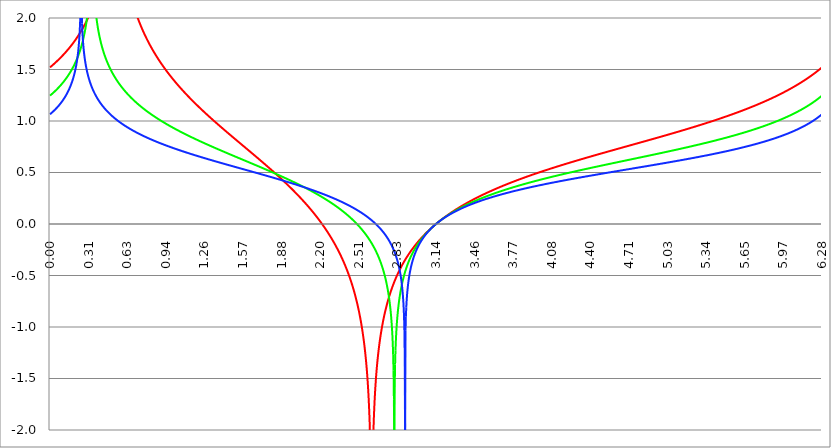
| Category | Series 1 | Series 0 | Series 2 |
|---|---|---|---|
| 0.0 | 1.521 | 1.246 | 1.066 |
| 0.00314159265358979 | 1.524 | 1.25 | 1.069 |
| 0.00628318530717958 | 1.527 | 1.253 | 1.072 |
| 0.00942477796076938 | 1.53 | 1.256 | 1.075 |
| 0.0125663706143592 | 1.533 | 1.259 | 1.078 |
| 0.015707963267949 | 1.537 | 1.263 | 1.082 |
| 0.0188495559215388 | 1.54 | 1.266 | 1.085 |
| 0.0219911485751285 | 1.543 | 1.269 | 1.089 |
| 0.0251327412287183 | 1.546 | 1.273 | 1.092 |
| 0.0282743338823081 | 1.55 | 1.276 | 1.096 |
| 0.0314159265358979 | 1.553 | 1.279 | 1.099 |
| 0.0345575191894877 | 1.557 | 1.283 | 1.103 |
| 0.0376991118430775 | 1.56 | 1.286 | 1.106 |
| 0.0408407044966673 | 1.563 | 1.29 | 1.11 |
| 0.0439822971502571 | 1.567 | 1.294 | 1.114 |
| 0.0471238898038469 | 1.57 | 1.297 | 1.118 |
| 0.0502654824574367 | 1.574 | 1.301 | 1.122 |
| 0.0534070751110265 | 1.577 | 1.305 | 1.126 |
| 0.0565486677646163 | 1.581 | 1.308 | 1.13 |
| 0.059690260418206 | 1.584 | 1.312 | 1.134 |
| 0.0628318530717958 | 1.588 | 1.316 | 1.138 |
| 0.0659734457253856 | 1.591 | 1.32 | 1.142 |
| 0.0691150383789754 | 1.595 | 1.324 | 1.146 |
| 0.0722566310325652 | 1.599 | 1.328 | 1.151 |
| 0.075398223686155 | 1.602 | 1.332 | 1.155 |
| 0.0785398163397448 | 1.606 | 1.336 | 1.16 |
| 0.0816814089933346 | 1.61 | 1.34 | 1.164 |
| 0.0848230016469244 | 1.614 | 1.344 | 1.169 |
| 0.0879645943005142 | 1.617 | 1.349 | 1.174 |
| 0.091106186954104 | 1.621 | 1.353 | 1.179 |
| 0.0942477796076937 | 1.625 | 1.357 | 1.184 |
| 0.0973893722612835 | 1.629 | 1.362 | 1.189 |
| 0.100530964914873 | 1.633 | 1.366 | 1.194 |
| 0.103672557568463 | 1.637 | 1.371 | 1.199 |
| 0.106814150222053 | 1.641 | 1.375 | 1.205 |
| 0.109955742875643 | 1.645 | 1.38 | 1.21 |
| 0.113097335529233 | 1.649 | 1.385 | 1.216 |
| 0.116238928182822 | 1.653 | 1.389 | 1.222 |
| 0.119380520836412 | 1.657 | 1.394 | 1.228 |
| 0.122522113490002 | 1.661 | 1.399 | 1.234 |
| 0.125663706143592 | 1.665 | 1.404 | 1.24 |
| 0.128805298797181 | 1.67 | 1.409 | 1.246 |
| 0.131946891450771 | 1.674 | 1.414 | 1.253 |
| 0.135088484104361 | 1.678 | 1.42 | 1.26 |
| 0.138230076757951 | 1.682 | 1.425 | 1.267 |
| 0.141371669411541 | 1.687 | 1.43 | 1.274 |
| 0.14451326206513 | 1.691 | 1.436 | 1.281 |
| 0.14765485471872 | 1.696 | 1.441 | 1.289 |
| 0.15079644737231 | 1.7 | 1.447 | 1.296 |
| 0.1539380400259 | 1.705 | 1.453 | 1.304 |
| 0.15707963267949 | 1.709 | 1.459 | 1.313 |
| 0.160221225333079 | 1.714 | 1.465 | 1.321 |
| 0.163362817986669 | 1.718 | 1.471 | 1.33 |
| 0.166504410640259 | 1.723 | 1.477 | 1.339 |
| 0.169646003293849 | 1.728 | 1.483 | 1.349 |
| 0.172787595947439 | 1.733 | 1.49 | 1.358 |
| 0.175929188601028 | 1.737 | 1.496 | 1.369 |
| 0.179070781254618 | 1.742 | 1.503 | 1.379 |
| 0.182212373908208 | 1.747 | 1.51 | 1.391 |
| 0.185353966561798 | 1.752 | 1.517 | 1.402 |
| 0.188495559215388 | 1.757 | 1.524 | 1.414 |
| 0.191637151868977 | 1.762 | 1.531 | 1.427 |
| 0.194778744522567 | 1.767 | 1.538 | 1.441 |
| 0.197920337176157 | 1.772 | 1.546 | 1.455 |
| 0.201061929829747 | 1.778 | 1.554 | 1.47 |
| 0.204203522483336 | 1.783 | 1.562 | 1.486 |
| 0.207345115136926 | 1.788 | 1.57 | 1.504 |
| 0.210486707790516 | 1.794 | 1.578 | 1.522 |
| 0.213628300444106 | 1.799 | 1.587 | 1.542 |
| 0.216769893097696 | 1.804 | 1.595 | 1.564 |
| 0.219911485751285 | 1.81 | 1.604 | 1.587 |
| 0.223053078404875 | 1.816 | 1.614 | 1.613 |
| 0.226194671058465 | 1.821 | 1.623 | 1.642 |
| 0.229336263712055 | 1.827 | 1.633 | 1.674 |
| 0.232477856365645 | 1.833 | 1.643 | 1.712 |
| 0.235619449019234 | 1.839 | 1.653 | 1.755 |
| 0.238761041672824 | 1.845 | 1.664 | 1.808 |
| 0.241902634326414 | 1.851 | 1.675 | 1.873 |
| 0.245044226980004 | 1.857 | 1.686 | 1.962 |
| 0.248185819633594 | 1.863 | 1.698 | 2.099 |
| 0.251327412287183 | 1.869 | 1.71 | 2.409 |
| 0.254469004940773 | 1.875 | 1.723 | 2.337 |
| 0.257610597594363 | 1.882 | 1.736 | 2.075 |
| 0.260752190247953 | 1.888 | 1.749 | 1.947 |
| 0.263893782901543 | 1.895 | 1.763 | 1.863 |
| 0.267035375555132 | 1.901 | 1.778 | 1.799 |
| 0.270176968208722 | 1.908 | 1.794 | 1.747 |
| 0.273318560862312 | 1.915 | 1.81 | 1.705 |
| 0.276460153515902 | 1.922 | 1.827 | 1.668 |
| 0.279601746169492 | 1.929 | 1.844 | 1.636 |
| 0.282743338823082 | 1.936 | 1.863 | 1.607 |
| 0.285884931476671 | 1.943 | 1.883 | 1.581 |
| 0.289026524130261 | 1.95 | 1.904 | 1.558 |
| 0.292168116783851 | 1.957 | 1.926 | 1.536 |
| 0.295309709437441 | 1.965 | 1.95 | 1.517 |
| 0.298451302091031 | 1.972 | 1.976 | 1.498 |
| 0.30159289474462 | 1.98 | 2.004 | 1.481 |
| 0.30473448739821 | 1.988 | 2.034 | 1.465 |
| 0.3078760800518 | 1.996 | 2.067 | 1.449 |
| 0.31101767270539 | 2.004 | 2.103 | 1.435 |
| 0.31415926535898 | 2.012 | 2.144 | 1.421 |
| 0.31730085801257 | 2.02 | 2.19 | 1.408 |
| 0.320442450666159 | 2.029 | 2.243 | 1.396 |
| 0.323584043319749 | 2.037 | 2.305 | 1.384 |
| 0.326725635973339 | 2.046 | 2.381 | 1.373 |
| 0.329867228626929 | 2.055 | 2.477 | 1.362 |
| 0.333008821280519 | 2.064 | 2.611 | 1.352 |
| 0.336150413934108 | 2.073 | 2.829 | 1.342 |
| 0.339292006587698 | 2.082 | 3.504 | 1.332 |
| 0.342433599241288 | 2.092 | 2.952 | 1.323 |
| 0.345575191894878 | 2.101 | 2.672 | 1.314 |
| 0.348716784548468 | 2.111 | 2.517 | 1.305 |
| 0.351858377202058 | 2.121 | 2.41 | 1.297 |
| 0.354999969855647 | 2.131 | 2.328 | 1.288 |
| 0.358141562509237 | 2.142 | 2.261 | 1.28 |
| 0.361283155162827 | 2.152 | 2.205 | 1.273 |
| 0.364424747816417 | 2.163 | 2.156 | 1.265 |
| 0.367566340470007 | 2.174 | 2.113 | 1.258 |
| 0.370707933123597 | 2.186 | 2.075 | 1.251 |
| 0.373849525777186 | 2.197 | 2.041 | 1.244 |
| 0.376991118430776 | 2.209 | 2.009 | 1.237 |
| 0.380132711084366 | 2.221 | 1.98 | 1.231 |
| 0.383274303737956 | 2.233 | 1.954 | 1.224 |
| 0.386415896391546 | 2.246 | 1.929 | 1.218 |
| 0.389557489045135 | 2.259 | 1.905 | 1.212 |
| 0.392699081698725 | 2.272 | 1.884 | 1.206 |
| 0.395840674352315 | 2.286 | 1.863 | 1.2 |
| 0.398982267005905 | 2.3 | 1.843 | 1.194 |
| 0.402123859659495 | 2.314 | 1.825 | 1.189 |
| 0.405265452313085 | 2.328 | 1.807 | 1.183 |
| 0.408407044966674 | 2.344 | 1.791 | 1.178 |
| 0.411548637620264 | 2.359 | 1.774 | 1.173 |
| 0.414690230273854 | 2.375 | 1.759 | 1.167 |
| 0.417831822927444 | 2.391 | 1.744 | 1.162 |
| 0.420973415581034 | 2.408 | 1.73 | 1.157 |
| 0.424115008234623 | 2.426 | 1.717 | 1.152 |
| 0.427256600888213 | 2.444 | 1.703 | 1.148 |
| 0.430398193541803 | 2.462 | 1.691 | 1.143 |
| 0.433539786195393 | 2.482 | 1.678 | 1.138 |
| 0.436681378848983 | 2.502 | 1.667 | 1.134 |
| 0.439822971502573 | 2.523 | 1.655 | 1.129 |
| 0.442964564156162 | 2.544 | 1.644 | 1.125 |
| 0.446106156809752 | 2.567 | 1.633 | 1.12 |
| 0.449247749463342 | 2.59 | 1.622 | 1.116 |
| 0.452389342116932 | 2.614 | 1.612 | 1.112 |
| 0.455530934770522 | 2.64 | 1.602 | 1.108 |
| 0.458672527424111 | 2.667 | 1.593 | 1.103 |
| 0.461814120077701 | 2.695 | 1.583 | 1.099 |
| 0.464955712731291 | 2.725 | 1.574 | 1.095 |
| 0.468097305384881 | 2.756 | 1.565 | 1.091 |
| 0.471238898038471 | 2.789 | 1.556 | 1.088 |
| 0.474380490692061 | 2.824 | 1.548 | 1.084 |
| 0.47752208334565 | 2.862 | 1.539 | 1.08 |
| 0.48066367599924 | 2.902 | 1.531 | 1.076 |
| 0.48380526865283 | 2.945 | 1.523 | 1.073 |
| 0.48694686130642 | 2.992 | 1.515 | 1.069 |
| 0.49008845396001 | 3.044 | 1.507 | 1.065 |
| 0.493230046613599 | 3.1 | 1.5 | 1.062 |
| 0.496371639267189 | 3.162 | 1.492 | 1.058 |
| 0.499513231920779 | 3.233 | 1.485 | 1.055 |
| 0.502654824574369 | 3.313 | 1.478 | 1.052 |
| 0.505796417227959 | 3.406 | 1.471 | 1.048 |
| 0.508938009881549 | 3.518 | 1.464 | 1.045 |
| 0.512079602535138 | 3.657 | 1.457 | 1.042 |
| 0.515221195188728 | 3.84 | 1.451 | 1.038 |
| 0.518362787842318 | 4.111 | 1.444 | 1.035 |
| 0.521504380495908 | 4.639 | 1.438 | 1.032 |
| 0.524645973149498 | 5.039 | 1.432 | 1.029 |
| 0.527787565803087 | 4.238 | 1.425 | 1.026 |
| 0.530929158456677 | 3.914 | 1.419 | 1.023 |
| 0.534070751110267 | 3.708 | 1.413 | 1.019 |
| 0.537212343763857 | 3.556 | 1.407 | 1.016 |
| 0.540353936417447 | 3.435 | 1.402 | 1.013 |
| 0.543495529071037 | 3.336 | 1.396 | 1.011 |
| 0.546637121724626 | 3.251 | 1.39 | 1.008 |
| 0.549778714378216 | 3.176 | 1.385 | 1.005 |
| 0.552920307031806 | 3.11 | 1.379 | 1.002 |
| 0.556061899685396 | 3.051 | 1.374 | 0.999 |
| 0.559203492338986 | 2.997 | 1.368 | 0.996 |
| 0.562345084992576 | 2.948 | 1.363 | 0.993 |
| 0.565486677646165 | 2.902 | 1.358 | 0.991 |
| 0.568628270299755 | 2.86 | 1.353 | 0.988 |
| 0.571769862953345 | 2.82 | 1.348 | 0.985 |
| 0.574911455606935 | 2.783 | 1.343 | 0.983 |
| 0.578053048260525 | 2.749 | 1.338 | 0.98 |
| 0.581194640914114 | 2.716 | 1.333 | 0.977 |
| 0.584336233567704 | 2.684 | 1.328 | 0.975 |
| 0.587477826221294 | 2.655 | 1.323 | 0.972 |
| 0.590619418874884 | 2.626 | 1.319 | 0.969 |
| 0.593761011528474 | 2.599 | 1.314 | 0.967 |
| 0.596902604182064 | 2.574 | 1.309 | 0.964 |
| 0.600044196835653 | 2.549 | 1.305 | 0.962 |
| 0.603185789489243 | 2.525 | 1.3 | 0.959 |
| 0.606327382142833 | 2.502 | 1.296 | 0.957 |
| 0.609468974796423 | 2.48 | 1.291 | 0.954 |
| 0.612610567450013 | 2.459 | 1.287 | 0.952 |
| 0.615752160103602 | 2.438 | 1.283 | 0.95 |
| 0.618893752757192 | 2.418 | 1.278 | 0.947 |
| 0.622035345410782 | 2.399 | 1.274 | 0.945 |
| 0.625176938064372 | 2.38 | 1.27 | 0.943 |
| 0.628318530717962 | 2.362 | 1.266 | 0.94 |
| 0.631460123371551 | 2.344 | 1.262 | 0.938 |
| 0.634601716025141 | 2.327 | 1.258 | 0.936 |
| 0.637743308678731 | 2.311 | 1.254 | 0.933 |
| 0.640884901332321 | 2.294 | 1.25 | 0.931 |
| 0.644026493985911 | 2.278 | 1.246 | 0.929 |
| 0.647168086639501 | 2.263 | 1.242 | 0.927 |
| 0.65030967929309 | 2.248 | 1.238 | 0.924 |
| 0.65345127194668 | 2.233 | 1.234 | 0.922 |
| 0.65659286460027 | 2.219 | 1.23 | 0.92 |
| 0.65973445725386 | 2.205 | 1.227 | 0.918 |
| 0.66287604990745 | 2.191 | 1.223 | 0.916 |
| 0.666017642561039 | 2.177 | 1.219 | 0.913 |
| 0.669159235214629 | 2.164 | 1.216 | 0.911 |
| 0.672300827868219 | 2.151 | 1.212 | 0.909 |
| 0.675442420521809 | 2.139 | 1.208 | 0.907 |
| 0.678584013175399 | 2.126 | 1.205 | 0.905 |
| 0.681725605828989 | 2.114 | 1.201 | 0.903 |
| 0.684867198482578 | 2.102 | 1.198 | 0.901 |
| 0.688008791136168 | 2.09 | 1.194 | 0.899 |
| 0.691150383789758 | 2.079 | 1.191 | 0.897 |
| 0.694291976443348 | 2.068 | 1.187 | 0.895 |
| 0.697433569096938 | 2.056 | 1.184 | 0.893 |
| 0.700575161750528 | 2.045 | 1.181 | 0.891 |
| 0.703716754404117 | 2.035 | 1.177 | 0.889 |
| 0.706858347057707 | 2.024 | 1.174 | 0.887 |
| 0.709999939711297 | 2.014 | 1.171 | 0.885 |
| 0.713141532364887 | 2.003 | 1.167 | 0.883 |
| 0.716283125018477 | 1.993 | 1.164 | 0.881 |
| 0.719424717672066 | 1.983 | 1.161 | 0.879 |
| 0.722566310325656 | 1.974 | 1.158 | 0.877 |
| 0.725707902979246 | 1.964 | 1.154 | 0.875 |
| 0.728849495632836 | 1.954 | 1.151 | 0.873 |
| 0.731991088286426 | 1.945 | 1.148 | 0.871 |
| 0.735132680940016 | 1.936 | 1.145 | 0.87 |
| 0.738274273593605 | 1.927 | 1.142 | 0.868 |
| 0.741415866247195 | 1.917 | 1.139 | 0.866 |
| 0.744557458900785 | 1.909 | 1.136 | 0.864 |
| 0.747699051554375 | 1.9 | 1.133 | 0.862 |
| 0.750840644207965 | 1.891 | 1.13 | 0.86 |
| 0.753982236861554 | 1.883 | 1.127 | 0.859 |
| 0.757123829515144 | 1.874 | 1.124 | 0.857 |
| 0.760265422168734 | 1.866 | 1.121 | 0.855 |
| 0.763407014822324 | 1.857 | 1.118 | 0.853 |
| 0.766548607475914 | 1.849 | 1.115 | 0.851 |
| 0.769690200129504 | 1.841 | 1.112 | 0.85 |
| 0.772831792783093 | 1.833 | 1.109 | 0.848 |
| 0.775973385436683 | 1.825 | 1.106 | 0.846 |
| 0.779114978090273 | 1.818 | 1.103 | 0.844 |
| 0.782256570743863 | 1.81 | 1.101 | 0.843 |
| 0.785398163397453 | 1.802 | 1.098 | 0.841 |
| 0.788539756051042 | 1.795 | 1.095 | 0.839 |
| 0.791681348704632 | 1.787 | 1.092 | 0.838 |
| 0.794822941358222 | 1.78 | 1.09 | 0.836 |
| 0.797964534011812 | 1.773 | 1.087 | 0.834 |
| 0.801106126665402 | 1.765 | 1.084 | 0.832 |
| 0.804247719318992 | 1.758 | 1.081 | 0.831 |
| 0.807389311972581 | 1.751 | 1.079 | 0.829 |
| 0.810530904626171 | 1.744 | 1.076 | 0.827 |
| 0.813672497279761 | 1.737 | 1.073 | 0.826 |
| 0.816814089933351 | 1.73 | 1.071 | 0.824 |
| 0.819955682586941 | 1.723 | 1.068 | 0.823 |
| 0.823097275240531 | 1.717 | 1.065 | 0.821 |
| 0.82623886789412 | 1.71 | 1.063 | 0.819 |
| 0.82938046054771 | 1.703 | 1.06 | 0.818 |
| 0.8325220532013 | 1.697 | 1.058 | 0.816 |
| 0.83566364585489 | 1.69 | 1.055 | 0.814 |
| 0.83880523850848 | 1.684 | 1.052 | 0.813 |
| 0.841946831162069 | 1.677 | 1.05 | 0.811 |
| 0.845088423815659 | 1.671 | 1.047 | 0.81 |
| 0.848230016469249 | 1.665 | 1.045 | 0.808 |
| 0.851371609122839 | 1.658 | 1.042 | 0.807 |
| 0.854513201776429 | 1.652 | 1.04 | 0.805 |
| 0.857654794430019 | 1.646 | 1.037 | 0.803 |
| 0.860796387083608 | 1.64 | 1.035 | 0.802 |
| 0.863937979737198 | 1.634 | 1.032 | 0.8 |
| 0.867079572390788 | 1.628 | 1.03 | 0.799 |
| 0.870221165044378 | 1.622 | 1.028 | 0.797 |
| 0.873362757697968 | 1.616 | 1.025 | 0.796 |
| 0.876504350351557 | 1.61 | 1.023 | 0.794 |
| 0.879645943005147 | 1.604 | 1.02 | 0.793 |
| 0.882787535658737 | 1.598 | 1.018 | 0.791 |
| 0.885929128312327 | 1.593 | 1.016 | 0.79 |
| 0.889070720965917 | 1.587 | 1.013 | 0.788 |
| 0.892212313619507 | 1.581 | 1.011 | 0.787 |
| 0.895353906273096 | 1.576 | 1.008 | 0.785 |
| 0.898495498926686 | 1.57 | 1.006 | 0.784 |
| 0.901637091580276 | 1.565 | 1.004 | 0.782 |
| 0.904778684233866 | 1.559 | 1.001 | 0.781 |
| 0.907920276887456 | 1.554 | 0.999 | 0.779 |
| 0.911061869541045 | 1.548 | 0.997 | 0.778 |
| 0.914203462194635 | 1.543 | 0.995 | 0.776 |
| 0.917345054848225 | 1.537 | 0.992 | 0.775 |
| 0.920486647501815 | 1.532 | 0.99 | 0.774 |
| 0.923628240155405 | 1.527 | 0.988 | 0.772 |
| 0.926769832808995 | 1.522 | 0.986 | 0.771 |
| 0.929911425462584 | 1.516 | 0.983 | 0.769 |
| 0.933053018116174 | 1.511 | 0.981 | 0.768 |
| 0.936194610769764 | 1.506 | 0.979 | 0.766 |
| 0.939336203423354 | 1.501 | 0.977 | 0.765 |
| 0.942477796076944 | 1.496 | 0.974 | 0.764 |
| 0.945619388730533 | 1.491 | 0.972 | 0.762 |
| 0.948760981384123 | 1.486 | 0.97 | 0.761 |
| 0.951902574037713 | 1.481 | 0.968 | 0.759 |
| 0.955044166691303 | 1.476 | 0.966 | 0.758 |
| 0.958185759344893 | 1.471 | 0.964 | 0.757 |
| 0.961327351998483 | 1.466 | 0.961 | 0.755 |
| 0.964468944652072 | 1.461 | 0.959 | 0.754 |
| 0.967610537305662 | 1.456 | 0.957 | 0.753 |
| 0.970752129959252 | 1.451 | 0.955 | 0.751 |
| 0.973893722612842 | 1.446 | 0.953 | 0.75 |
| 0.977035315266432 | 1.442 | 0.951 | 0.748 |
| 0.980176907920022 | 1.437 | 0.949 | 0.747 |
| 0.983318500573611 | 1.432 | 0.947 | 0.746 |
| 0.986460093227201 | 1.427 | 0.944 | 0.744 |
| 0.989601685880791 | 1.423 | 0.942 | 0.743 |
| 0.992743278534381 | 1.418 | 0.94 | 0.742 |
| 0.995884871187971 | 1.413 | 0.938 | 0.74 |
| 0.99902646384156 | 1.409 | 0.936 | 0.739 |
| 1.00216805649515 | 1.404 | 0.934 | 0.738 |
| 1.00530964914874 | 1.4 | 0.932 | 0.736 |
| 1.00845124180233 | 1.395 | 0.93 | 0.735 |
| 1.01159283445592 | 1.39 | 0.928 | 0.734 |
| 1.01473442710951 | 1.386 | 0.926 | 0.732 |
| 1.017876019763099 | 1.382 | 0.924 | 0.731 |
| 1.021017612416689 | 1.377 | 0.922 | 0.73 |
| 1.02415920507028 | 1.373 | 0.92 | 0.729 |
| 1.027300797723869 | 1.368 | 0.918 | 0.727 |
| 1.030442390377459 | 1.364 | 0.916 | 0.726 |
| 1.033583983031048 | 1.359 | 0.914 | 0.725 |
| 1.036725575684638 | 1.355 | 0.912 | 0.723 |
| 1.039867168338228 | 1.351 | 0.91 | 0.722 |
| 1.043008760991818 | 1.346 | 0.908 | 0.721 |
| 1.046150353645408 | 1.342 | 0.906 | 0.72 |
| 1.049291946298998 | 1.338 | 0.904 | 0.718 |
| 1.052433538952587 | 1.333 | 0.902 | 0.717 |
| 1.055575131606177 | 1.329 | 0.9 | 0.716 |
| 1.058716724259767 | 1.325 | 0.898 | 0.714 |
| 1.061858316913357 | 1.321 | 0.896 | 0.713 |
| 1.064999909566947 | 1.317 | 0.894 | 0.712 |
| 1.068141502220536 | 1.312 | 0.892 | 0.711 |
| 1.071283094874126 | 1.308 | 0.89 | 0.709 |
| 1.074424687527716 | 1.304 | 0.888 | 0.708 |
| 1.077566280181306 | 1.3 | 0.886 | 0.707 |
| 1.080707872834896 | 1.296 | 0.885 | 0.706 |
| 1.083849465488486 | 1.292 | 0.883 | 0.704 |
| 1.086991058142075 | 1.288 | 0.881 | 0.703 |
| 1.090132650795665 | 1.284 | 0.879 | 0.702 |
| 1.093274243449255 | 1.28 | 0.877 | 0.701 |
| 1.096415836102845 | 1.275 | 0.875 | 0.699 |
| 1.099557428756435 | 1.271 | 0.873 | 0.698 |
| 1.102699021410025 | 1.267 | 0.871 | 0.697 |
| 1.105840614063614 | 1.263 | 0.869 | 0.696 |
| 1.108982206717204 | 1.259 | 0.868 | 0.695 |
| 1.112123799370794 | 1.256 | 0.866 | 0.693 |
| 1.115265392024384 | 1.252 | 0.864 | 0.692 |
| 1.118406984677974 | 1.248 | 0.862 | 0.691 |
| 1.121548577331563 | 1.244 | 0.86 | 0.69 |
| 1.124690169985153 | 1.24 | 0.858 | 0.689 |
| 1.127831762638743 | 1.236 | 0.857 | 0.687 |
| 1.130973355292333 | 1.232 | 0.855 | 0.686 |
| 1.134114947945923 | 1.228 | 0.853 | 0.685 |
| 1.137256540599513 | 1.224 | 0.851 | 0.684 |
| 1.140398133253102 | 1.22 | 0.849 | 0.683 |
| 1.143539725906692 | 1.217 | 0.847 | 0.681 |
| 1.146681318560282 | 1.213 | 0.846 | 0.68 |
| 1.149822911213872 | 1.209 | 0.844 | 0.679 |
| 1.152964503867462 | 1.205 | 0.842 | 0.678 |
| 1.156106096521051 | 1.201 | 0.84 | 0.677 |
| 1.159247689174641 | 1.198 | 0.838 | 0.675 |
| 1.162389281828231 | 1.194 | 0.837 | 0.674 |
| 1.165530874481821 | 1.19 | 0.835 | 0.673 |
| 1.168672467135411 | 1.186 | 0.833 | 0.672 |
| 1.171814059789001 | 1.183 | 0.831 | 0.671 |
| 1.17495565244259 | 1.179 | 0.829 | 0.67 |
| 1.17809724509618 | 1.175 | 0.828 | 0.668 |
| 1.18123883774977 | 1.171 | 0.826 | 0.667 |
| 1.18438043040336 | 1.168 | 0.824 | 0.666 |
| 1.18752202305695 | 1.164 | 0.822 | 0.665 |
| 1.190663615710539 | 1.16 | 0.821 | 0.664 |
| 1.193805208364129 | 1.157 | 0.819 | 0.663 |
| 1.19694680101772 | 1.153 | 0.817 | 0.661 |
| 1.200088393671309 | 1.149 | 0.815 | 0.66 |
| 1.203229986324899 | 1.146 | 0.814 | 0.659 |
| 1.206371578978489 | 1.142 | 0.812 | 0.658 |
| 1.209513171632078 | 1.139 | 0.81 | 0.657 |
| 1.212654764285668 | 1.135 | 0.808 | 0.656 |
| 1.215796356939258 | 1.131 | 0.807 | 0.655 |
| 1.218937949592848 | 1.128 | 0.805 | 0.653 |
| 1.222079542246438 | 1.124 | 0.803 | 0.652 |
| 1.225221134900027 | 1.121 | 0.801 | 0.651 |
| 1.228362727553617 | 1.117 | 0.8 | 0.65 |
| 1.231504320207207 | 1.114 | 0.798 | 0.649 |
| 1.234645912860797 | 1.11 | 0.796 | 0.648 |
| 1.237787505514387 | 1.106 | 0.795 | 0.647 |
| 1.240929098167977 | 1.103 | 0.793 | 0.645 |
| 1.244070690821566 | 1.099 | 0.791 | 0.644 |
| 1.247212283475156 | 1.096 | 0.789 | 0.643 |
| 1.250353876128746 | 1.092 | 0.788 | 0.642 |
| 1.253495468782336 | 1.089 | 0.786 | 0.641 |
| 1.256637061435926 | 1.085 | 0.784 | 0.64 |
| 1.259778654089515 | 1.082 | 0.783 | 0.639 |
| 1.262920246743105 | 1.078 | 0.781 | 0.638 |
| 1.266061839396695 | 1.075 | 0.779 | 0.637 |
| 1.269203432050285 | 1.072 | 0.778 | 0.635 |
| 1.272345024703875 | 1.068 | 0.776 | 0.634 |
| 1.275486617357465 | 1.065 | 0.774 | 0.633 |
| 1.278628210011054 | 1.061 | 0.773 | 0.632 |
| 1.281769802664644 | 1.058 | 0.771 | 0.631 |
| 1.284911395318234 | 1.054 | 0.769 | 0.63 |
| 1.288052987971824 | 1.051 | 0.768 | 0.629 |
| 1.291194580625414 | 1.048 | 0.766 | 0.628 |
| 1.294336173279003 | 1.044 | 0.764 | 0.627 |
| 1.297477765932593 | 1.041 | 0.763 | 0.625 |
| 1.300619358586183 | 1.037 | 0.761 | 0.624 |
| 1.303760951239773 | 1.034 | 0.759 | 0.623 |
| 1.306902543893363 | 1.031 | 0.758 | 0.622 |
| 1.310044136546953 | 1.027 | 0.756 | 0.621 |
| 1.313185729200542 | 1.024 | 0.754 | 0.62 |
| 1.316327321854132 | 1.021 | 0.753 | 0.619 |
| 1.319468914507722 | 1.017 | 0.751 | 0.618 |
| 1.322610507161312 | 1.014 | 0.749 | 0.617 |
| 1.325752099814902 | 1.01 | 0.748 | 0.616 |
| 1.328893692468491 | 1.007 | 0.746 | 0.614 |
| 1.332035285122081 | 1.004 | 0.744 | 0.613 |
| 1.335176877775671 | 1 | 0.743 | 0.612 |
| 1.338318470429261 | 0.997 | 0.741 | 0.611 |
| 1.341460063082851 | 0.994 | 0.739 | 0.61 |
| 1.344601655736441 | 0.991 | 0.738 | 0.609 |
| 1.34774324839003 | 0.987 | 0.736 | 0.608 |
| 1.35088484104362 | 0.984 | 0.735 | 0.607 |
| 1.35402643369721 | 0.981 | 0.733 | 0.606 |
| 1.3571680263508 | 0.977 | 0.731 | 0.605 |
| 1.36030961900439 | 0.974 | 0.73 | 0.604 |
| 1.363451211657979 | 0.971 | 0.728 | 0.603 |
| 1.36659280431157 | 0.967 | 0.726 | 0.601 |
| 1.369734396965159 | 0.964 | 0.725 | 0.6 |
| 1.372875989618749 | 0.961 | 0.723 | 0.599 |
| 1.376017582272339 | 0.958 | 0.722 | 0.598 |
| 1.379159174925929 | 0.954 | 0.72 | 0.597 |
| 1.382300767579518 | 0.951 | 0.718 | 0.596 |
| 1.385442360233108 | 0.948 | 0.717 | 0.595 |
| 1.388583952886698 | 0.945 | 0.715 | 0.594 |
| 1.391725545540288 | 0.941 | 0.713 | 0.593 |
| 1.394867138193878 | 0.938 | 0.712 | 0.592 |
| 1.398008730847468 | 0.935 | 0.71 | 0.591 |
| 1.401150323501057 | 0.932 | 0.709 | 0.59 |
| 1.404291916154647 | 0.928 | 0.707 | 0.589 |
| 1.407433508808237 | 0.925 | 0.705 | 0.588 |
| 1.410575101461827 | 0.922 | 0.704 | 0.586 |
| 1.413716694115417 | 0.919 | 0.702 | 0.585 |
| 1.416858286769006 | 0.916 | 0.701 | 0.584 |
| 1.419999879422596 | 0.912 | 0.699 | 0.583 |
| 1.423141472076186 | 0.909 | 0.697 | 0.582 |
| 1.426283064729776 | 0.906 | 0.696 | 0.581 |
| 1.429424657383366 | 0.903 | 0.694 | 0.58 |
| 1.432566250036956 | 0.899 | 0.693 | 0.579 |
| 1.435707842690545 | 0.896 | 0.691 | 0.578 |
| 1.438849435344135 | 0.893 | 0.689 | 0.577 |
| 1.441991027997725 | 0.89 | 0.688 | 0.576 |
| 1.445132620651315 | 0.887 | 0.686 | 0.575 |
| 1.448274213304905 | 0.883 | 0.685 | 0.574 |
| 1.451415805958494 | 0.88 | 0.683 | 0.573 |
| 1.454557398612084 | 0.877 | 0.682 | 0.572 |
| 1.457698991265674 | 0.874 | 0.68 | 0.571 |
| 1.460840583919264 | 0.871 | 0.678 | 0.57 |
| 1.463982176572854 | 0.868 | 0.677 | 0.568 |
| 1.467123769226444 | 0.864 | 0.675 | 0.567 |
| 1.470265361880033 | 0.861 | 0.674 | 0.566 |
| 1.473406954533623 | 0.858 | 0.672 | 0.565 |
| 1.476548547187213 | 0.855 | 0.67 | 0.564 |
| 1.479690139840803 | 0.852 | 0.669 | 0.563 |
| 1.482831732494393 | 0.849 | 0.667 | 0.562 |
| 1.485973325147982 | 0.845 | 0.666 | 0.561 |
| 1.489114917801572 | 0.842 | 0.664 | 0.56 |
| 1.492256510455162 | 0.839 | 0.663 | 0.559 |
| 1.495398103108752 | 0.836 | 0.661 | 0.558 |
| 1.498539695762342 | 0.833 | 0.659 | 0.557 |
| 1.501681288415932 | 0.83 | 0.658 | 0.556 |
| 1.504822881069521 | 0.826 | 0.656 | 0.555 |
| 1.507964473723111 | 0.823 | 0.655 | 0.554 |
| 1.511106066376701 | 0.82 | 0.653 | 0.553 |
| 1.514247659030291 | 0.817 | 0.652 | 0.552 |
| 1.517389251683881 | 0.814 | 0.65 | 0.551 |
| 1.520530844337471 | 0.811 | 0.648 | 0.55 |
| 1.52367243699106 | 0.808 | 0.647 | 0.548 |
| 1.52681402964465 | 0.804 | 0.645 | 0.547 |
| 1.52995562229824 | 0.801 | 0.644 | 0.546 |
| 1.53309721495183 | 0.798 | 0.642 | 0.545 |
| 1.53623880760542 | 0.795 | 0.641 | 0.544 |
| 1.539380400259009 | 0.792 | 0.639 | 0.543 |
| 1.542521992912599 | 0.789 | 0.637 | 0.542 |
| 1.545663585566189 | 0.785 | 0.636 | 0.541 |
| 1.548805178219779 | 0.782 | 0.634 | 0.54 |
| 1.551946770873369 | 0.779 | 0.633 | 0.539 |
| 1.555088363526959 | 0.776 | 0.631 | 0.538 |
| 1.558229956180548 | 0.773 | 0.63 | 0.537 |
| 1.561371548834138 | 0.77 | 0.628 | 0.536 |
| 1.564513141487728 | 0.767 | 0.626 | 0.535 |
| 1.567654734141318 | 0.763 | 0.625 | 0.534 |
| 1.570796326794908 | 0.76 | 0.623 | 0.533 |
| 1.573937919448497 | 0.757 | 0.622 | 0.532 |
| 1.577079512102087 | 0.754 | 0.62 | 0.531 |
| 1.580221104755677 | 0.751 | 0.619 | 0.53 |
| 1.583362697409267 | 0.748 | 0.617 | 0.529 |
| 1.586504290062857 | 0.745 | 0.615 | 0.528 |
| 1.589645882716447 | 0.741 | 0.614 | 0.526 |
| 1.592787475370036 | 0.738 | 0.612 | 0.525 |
| 1.595929068023626 | 0.735 | 0.611 | 0.524 |
| 1.599070660677216 | 0.732 | 0.609 | 0.523 |
| 1.602212253330806 | 0.729 | 0.608 | 0.522 |
| 1.605353845984396 | 0.726 | 0.606 | 0.521 |
| 1.608495438637985 | 0.723 | 0.604 | 0.52 |
| 1.611637031291575 | 0.719 | 0.603 | 0.519 |
| 1.614778623945165 | 0.716 | 0.601 | 0.518 |
| 1.617920216598755 | 0.713 | 0.6 | 0.517 |
| 1.621061809252345 | 0.71 | 0.598 | 0.516 |
| 1.624203401905935 | 0.707 | 0.597 | 0.515 |
| 1.627344994559524 | 0.704 | 0.595 | 0.514 |
| 1.630486587213114 | 0.701 | 0.593 | 0.513 |
| 1.633628179866704 | 0.697 | 0.592 | 0.512 |
| 1.636769772520294 | 0.694 | 0.59 | 0.511 |
| 1.639911365173884 | 0.691 | 0.589 | 0.51 |
| 1.643052957827473 | 0.688 | 0.587 | 0.509 |
| 1.646194550481063 | 0.685 | 0.585 | 0.508 |
| 1.649336143134653 | 0.682 | 0.584 | 0.507 |
| 1.652477735788243 | 0.678 | 0.582 | 0.506 |
| 1.655619328441833 | 0.675 | 0.581 | 0.504 |
| 1.658760921095423 | 0.672 | 0.579 | 0.503 |
| 1.661902513749012 | 0.669 | 0.578 | 0.502 |
| 1.665044106402602 | 0.666 | 0.576 | 0.501 |
| 1.668185699056192 | 0.663 | 0.574 | 0.5 |
| 1.671327291709782 | 0.659 | 0.573 | 0.499 |
| 1.674468884363372 | 0.656 | 0.571 | 0.498 |
| 1.677610477016961 | 0.653 | 0.57 | 0.497 |
| 1.680752069670551 | 0.65 | 0.568 | 0.496 |
| 1.683893662324141 | 0.647 | 0.566 | 0.495 |
| 1.687035254977731 | 0.644 | 0.565 | 0.494 |
| 1.690176847631321 | 0.64 | 0.563 | 0.493 |
| 1.693318440284911 | 0.637 | 0.562 | 0.492 |
| 1.6964600329385 | 0.634 | 0.56 | 0.491 |
| 1.69960162559209 | 0.631 | 0.559 | 0.49 |
| 1.70274321824568 | 0.628 | 0.557 | 0.489 |
| 1.70588481089927 | 0.624 | 0.555 | 0.488 |
| 1.70902640355286 | 0.621 | 0.554 | 0.487 |
| 1.712167996206449 | 0.618 | 0.552 | 0.485 |
| 1.715309588860039 | 0.615 | 0.551 | 0.484 |
| 1.71845118151363 | 0.612 | 0.549 | 0.483 |
| 1.721592774167219 | 0.608 | 0.547 | 0.482 |
| 1.724734366820809 | 0.605 | 0.546 | 0.481 |
| 1.727875959474399 | 0.602 | 0.544 | 0.48 |
| 1.731017552127988 | 0.599 | 0.543 | 0.479 |
| 1.734159144781578 | 0.596 | 0.541 | 0.478 |
| 1.737300737435168 | 0.592 | 0.539 | 0.477 |
| 1.740442330088758 | 0.589 | 0.538 | 0.476 |
| 1.743583922742348 | 0.586 | 0.536 | 0.475 |
| 1.746725515395937 | 0.583 | 0.535 | 0.474 |
| 1.749867108049527 | 0.579 | 0.533 | 0.473 |
| 1.753008700703117 | 0.576 | 0.531 | 0.472 |
| 1.756150293356707 | 0.573 | 0.53 | 0.471 |
| 1.759291886010297 | 0.57 | 0.528 | 0.469 |
| 1.762433478663887 | 0.566 | 0.527 | 0.468 |
| 1.765575071317476 | 0.563 | 0.525 | 0.467 |
| 1.768716663971066 | 0.56 | 0.523 | 0.466 |
| 1.771858256624656 | 0.557 | 0.522 | 0.465 |
| 1.774999849278246 | 0.553 | 0.52 | 0.464 |
| 1.778141441931836 | 0.55 | 0.518 | 0.463 |
| 1.781283034585426 | 0.547 | 0.517 | 0.462 |
| 1.784424627239015 | 0.543 | 0.515 | 0.461 |
| 1.787566219892605 | 0.54 | 0.514 | 0.46 |
| 1.790707812546195 | 0.537 | 0.512 | 0.459 |
| 1.793849405199785 | 0.533 | 0.51 | 0.458 |
| 1.796990997853375 | 0.53 | 0.509 | 0.457 |
| 1.800132590506964 | 0.527 | 0.507 | 0.455 |
| 1.803274183160554 | 0.524 | 0.505 | 0.454 |
| 1.806415775814144 | 0.52 | 0.504 | 0.453 |
| 1.809557368467734 | 0.517 | 0.502 | 0.452 |
| 1.812698961121324 | 0.514 | 0.5 | 0.451 |
| 1.815840553774914 | 0.51 | 0.499 | 0.45 |
| 1.818982146428503 | 0.507 | 0.497 | 0.449 |
| 1.822123739082093 | 0.504 | 0.496 | 0.448 |
| 1.825265331735683 | 0.5 | 0.494 | 0.447 |
| 1.828406924389273 | 0.497 | 0.492 | 0.446 |
| 1.831548517042863 | 0.493 | 0.491 | 0.445 |
| 1.834690109696452 | 0.49 | 0.489 | 0.443 |
| 1.837831702350042 | 0.487 | 0.487 | 0.442 |
| 1.840973295003632 | 0.483 | 0.486 | 0.441 |
| 1.844114887657222 | 0.48 | 0.484 | 0.44 |
| 1.847256480310812 | 0.477 | 0.482 | 0.439 |
| 1.850398072964402 | 0.473 | 0.481 | 0.438 |
| 1.853539665617991 | 0.47 | 0.479 | 0.437 |
| 1.856681258271581 | 0.466 | 0.477 | 0.436 |
| 1.859822850925171 | 0.463 | 0.476 | 0.435 |
| 1.862964443578761 | 0.459 | 0.474 | 0.433 |
| 1.866106036232351 | 0.456 | 0.472 | 0.432 |
| 1.86924762888594 | 0.453 | 0.471 | 0.431 |
| 1.87238922153953 | 0.449 | 0.469 | 0.43 |
| 1.87553081419312 | 0.446 | 0.467 | 0.429 |
| 1.87867240684671 | 0.442 | 0.465 | 0.428 |
| 1.8818139995003 | 0.439 | 0.464 | 0.427 |
| 1.88495559215389 | 0.435 | 0.462 | 0.426 |
| 1.888097184807479 | 0.432 | 0.46 | 0.425 |
| 1.891238777461069 | 0.428 | 0.459 | 0.423 |
| 1.89438037011466 | 0.425 | 0.457 | 0.422 |
| 1.897521962768249 | 0.421 | 0.455 | 0.421 |
| 1.900663555421839 | 0.418 | 0.454 | 0.42 |
| 1.903805148075429 | 0.414 | 0.452 | 0.419 |
| 1.906946740729018 | 0.411 | 0.45 | 0.418 |
| 1.910088333382608 | 0.407 | 0.448 | 0.417 |
| 1.913229926036198 | 0.404 | 0.447 | 0.416 |
| 1.916371518689788 | 0.4 | 0.445 | 0.414 |
| 1.919513111343378 | 0.396 | 0.443 | 0.413 |
| 1.922654703996967 | 0.393 | 0.442 | 0.412 |
| 1.925796296650557 | 0.389 | 0.44 | 0.411 |
| 1.928937889304147 | 0.386 | 0.438 | 0.41 |
| 1.932079481957737 | 0.382 | 0.436 | 0.409 |
| 1.935221074611327 | 0.378 | 0.435 | 0.408 |
| 1.938362667264917 | 0.375 | 0.433 | 0.406 |
| 1.941504259918506 | 0.371 | 0.431 | 0.405 |
| 1.944645852572096 | 0.368 | 0.429 | 0.404 |
| 1.947787445225686 | 0.364 | 0.428 | 0.403 |
| 1.950929037879276 | 0.36 | 0.426 | 0.402 |
| 1.954070630532866 | 0.357 | 0.424 | 0.401 |
| 1.957212223186455 | 0.353 | 0.422 | 0.399 |
| 1.960353815840045 | 0.349 | 0.421 | 0.398 |
| 1.963495408493635 | 0.346 | 0.419 | 0.397 |
| 1.966637001147225 | 0.342 | 0.417 | 0.396 |
| 1.969778593800815 | 0.338 | 0.415 | 0.395 |
| 1.972920186454405 | 0.334 | 0.413 | 0.394 |
| 1.976061779107994 | 0.331 | 0.412 | 0.392 |
| 1.979203371761584 | 0.327 | 0.41 | 0.391 |
| 1.982344964415174 | 0.323 | 0.408 | 0.39 |
| 1.985486557068764 | 0.319 | 0.406 | 0.389 |
| 1.988628149722354 | 0.316 | 0.404 | 0.388 |
| 1.991769742375943 | 0.312 | 0.403 | 0.387 |
| 1.994911335029533 | 0.308 | 0.401 | 0.385 |
| 1.998052927683123 | 0.304 | 0.399 | 0.384 |
| 2.001194520336712 | 0.3 | 0.397 | 0.383 |
| 2.004336112990302 | 0.296 | 0.395 | 0.382 |
| 2.007477705643892 | 0.293 | 0.394 | 0.381 |
| 2.010619298297482 | 0.289 | 0.392 | 0.379 |
| 2.013760890951071 | 0.285 | 0.39 | 0.378 |
| 2.016902483604661 | 0.281 | 0.388 | 0.377 |
| 2.02004407625825 | 0.277 | 0.386 | 0.376 |
| 2.02318566891184 | 0.273 | 0.384 | 0.375 |
| 2.02632726156543 | 0.269 | 0.383 | 0.373 |
| 2.029468854219019 | 0.265 | 0.381 | 0.372 |
| 2.032610446872609 | 0.261 | 0.379 | 0.371 |
| 2.035752039526198 | 0.257 | 0.377 | 0.37 |
| 2.038893632179788 | 0.253 | 0.375 | 0.369 |
| 2.042035224833378 | 0.249 | 0.373 | 0.367 |
| 2.045176817486967 | 0.245 | 0.371 | 0.366 |
| 2.048318410140557 | 0.241 | 0.369 | 0.365 |
| 2.051460002794146 | 0.237 | 0.368 | 0.364 |
| 2.054601595447736 | 0.233 | 0.366 | 0.362 |
| 2.057743188101325 | 0.229 | 0.364 | 0.361 |
| 2.060884780754915 | 0.225 | 0.362 | 0.36 |
| 2.064026373408505 | 0.221 | 0.36 | 0.359 |
| 2.067167966062094 | 0.217 | 0.358 | 0.357 |
| 2.070309558715684 | 0.212 | 0.356 | 0.356 |
| 2.073451151369273 | 0.208 | 0.354 | 0.355 |
| 2.076592744022863 | 0.204 | 0.352 | 0.354 |
| 2.079734336676452 | 0.2 | 0.35 | 0.352 |
| 2.082875929330042 | 0.196 | 0.348 | 0.351 |
| 2.086017521983632 | 0.191 | 0.346 | 0.35 |
| 2.089159114637221 | 0.187 | 0.344 | 0.349 |
| 2.092300707290811 | 0.183 | 0.343 | 0.347 |
| 2.095442299944401 | 0.179 | 0.341 | 0.346 |
| 2.09858389259799 | 0.174 | 0.339 | 0.345 |
| 2.10172548525158 | 0.17 | 0.337 | 0.343 |
| 2.104867077905169 | 0.166 | 0.335 | 0.342 |
| 2.108008670558759 | 0.161 | 0.333 | 0.341 |
| 2.111150263212349 | 0.157 | 0.331 | 0.34 |
| 2.114291855865938 | 0.153 | 0.329 | 0.338 |
| 2.117433448519528 | 0.148 | 0.327 | 0.337 |
| 2.120575041173117 | 0.144 | 0.325 | 0.336 |
| 2.123716633826707 | 0.139 | 0.323 | 0.334 |
| 2.126858226480297 | 0.135 | 0.321 | 0.333 |
| 2.129999819133886 | 0.13 | 0.319 | 0.332 |
| 2.133141411787476 | 0.126 | 0.317 | 0.33 |
| 2.136283004441065 | 0.121 | 0.314 | 0.329 |
| 2.139424597094655 | 0.117 | 0.312 | 0.328 |
| 2.142566189748245 | 0.112 | 0.31 | 0.327 |
| 2.145707782401834 | 0.107 | 0.308 | 0.325 |
| 2.148849375055424 | 0.103 | 0.306 | 0.324 |
| 2.151990967709013 | 0.098 | 0.304 | 0.323 |
| 2.155132560362603 | 0.093 | 0.302 | 0.321 |
| 2.158274153016193 | 0.089 | 0.3 | 0.32 |
| 2.161415745669782 | 0.084 | 0.298 | 0.318 |
| 2.164557338323372 | 0.079 | 0.296 | 0.317 |
| 2.167698930976961 | 0.074 | 0.294 | 0.316 |
| 2.170840523630551 | 0.07 | 0.291 | 0.314 |
| 2.173982116284141 | 0.065 | 0.289 | 0.313 |
| 2.17712370893773 | 0.06 | 0.287 | 0.312 |
| 2.18026530159132 | 0.055 | 0.285 | 0.31 |
| 2.183406894244909 | 0.05 | 0.283 | 0.309 |
| 2.186548486898499 | 0.045 | 0.281 | 0.308 |
| 2.189690079552089 | 0.04 | 0.279 | 0.306 |
| 2.192831672205678 | 0.035 | 0.276 | 0.305 |
| 2.195973264859268 | 0.03 | 0.274 | 0.303 |
| 2.199114857512857 | 0.025 | 0.272 | 0.302 |
| 2.202256450166447 | 0.02 | 0.27 | 0.301 |
| 2.205398042820036 | 0.015 | 0.268 | 0.299 |
| 2.208539635473626 | 0.01 | 0.265 | 0.298 |
| 2.211681228127216 | 0.004 | 0.263 | 0.296 |
| 2.214822820780805 | -0.001 | 0.261 | 0.295 |
| 2.217964413434395 | -0.006 | 0.259 | 0.293 |
| 2.221106006087984 | -0.011 | 0.256 | 0.292 |
| 2.224247598741574 | -0.017 | 0.254 | 0.291 |
| 2.227389191395164 | -0.022 | 0.252 | 0.289 |
| 2.230530784048753 | -0.028 | 0.25 | 0.288 |
| 2.233672376702343 | -0.033 | 0.247 | 0.286 |
| 2.236813969355933 | -0.038 | 0.245 | 0.285 |
| 2.239955562009522 | -0.044 | 0.243 | 0.283 |
| 2.243097154663112 | -0.049 | 0.24 | 0.282 |
| 2.246238747316701 | -0.055 | 0.238 | 0.28 |
| 2.249380339970291 | -0.061 | 0.236 | 0.279 |
| 2.252521932623881 | -0.066 | 0.233 | 0.277 |
| 2.25566352527747 | -0.072 | 0.231 | 0.276 |
| 2.25880511793106 | -0.078 | 0.229 | 0.274 |
| 2.261946710584649 | -0.084 | 0.226 | 0.273 |
| 2.265088303238239 | -0.089 | 0.224 | 0.271 |
| 2.268229895891829 | -0.095 | 0.221 | 0.27 |
| 2.271371488545418 | -0.101 | 0.219 | 0.268 |
| 2.274513081199008 | -0.107 | 0.216 | 0.267 |
| 2.277654673852597 | -0.113 | 0.214 | 0.265 |
| 2.280796266506186 | -0.119 | 0.212 | 0.264 |
| 2.283937859159776 | -0.125 | 0.209 | 0.262 |
| 2.287079451813366 | -0.131 | 0.207 | 0.261 |
| 2.290221044466955 | -0.138 | 0.204 | 0.259 |
| 2.293362637120545 | -0.144 | 0.202 | 0.257 |
| 2.296504229774135 | -0.15 | 0.199 | 0.256 |
| 2.299645822427724 | -0.157 | 0.197 | 0.254 |
| 2.302787415081314 | -0.163 | 0.194 | 0.253 |
| 2.305929007734904 | -0.169 | 0.191 | 0.251 |
| 2.309070600388493 | -0.176 | 0.189 | 0.249 |
| 2.312212193042083 | -0.183 | 0.186 | 0.248 |
| 2.315353785695672 | -0.189 | 0.184 | 0.246 |
| 2.318495378349262 | -0.196 | 0.181 | 0.245 |
| 2.321636971002852 | -0.203 | 0.178 | 0.243 |
| 2.324778563656441 | -0.21 | 0.176 | 0.241 |
| 2.327920156310031 | -0.216 | 0.173 | 0.24 |
| 2.33106174896362 | -0.223 | 0.17 | 0.238 |
| 2.33420334161721 | -0.23 | 0.168 | 0.236 |
| 2.3373449342708 | -0.237 | 0.165 | 0.235 |
| 2.340486526924389 | -0.245 | 0.162 | 0.233 |
| 2.343628119577979 | -0.252 | 0.16 | 0.231 |
| 2.346769712231568 | -0.259 | 0.157 | 0.23 |
| 2.349911304885158 | -0.267 | 0.154 | 0.228 |
| 2.353052897538748 | -0.274 | 0.151 | 0.226 |
| 2.356194490192337 | -0.282 | 0.149 | 0.225 |
| 2.359336082845927 | -0.289 | 0.146 | 0.223 |
| 2.362477675499516 | -0.297 | 0.143 | 0.221 |
| 2.365619268153106 | -0.305 | 0.14 | 0.219 |
| 2.368760860806696 | -0.313 | 0.137 | 0.218 |
| 2.371902453460285 | -0.321 | 0.134 | 0.216 |
| 2.375044046113875 | -0.329 | 0.131 | 0.214 |
| 2.378185638767464 | -0.337 | 0.129 | 0.212 |
| 2.381327231421054 | -0.345 | 0.126 | 0.211 |
| 2.384468824074644 | -0.353 | 0.123 | 0.209 |
| 2.387610416728233 | -0.362 | 0.12 | 0.207 |
| 2.390752009381823 | -0.37 | 0.117 | 0.205 |
| 2.393893602035412 | -0.379 | 0.114 | 0.203 |
| 2.397035194689002 | -0.388 | 0.111 | 0.202 |
| 2.400176787342591 | -0.397 | 0.108 | 0.2 |
| 2.403318379996181 | -0.406 | 0.105 | 0.198 |
| 2.406459972649771 | -0.415 | 0.101 | 0.196 |
| 2.40960156530336 | -0.424 | 0.098 | 0.194 |
| 2.41274315795695 | -0.434 | 0.095 | 0.192 |
| 2.41588475061054 | -0.443 | 0.092 | 0.19 |
| 2.419026343264129 | -0.453 | 0.089 | 0.188 |
| 2.422167935917719 | -0.463 | 0.086 | 0.187 |
| 2.425309528571308 | -0.473 | 0.082 | 0.185 |
| 2.428451121224898 | -0.483 | 0.079 | 0.183 |
| 2.431592713878488 | -0.493 | 0.076 | 0.181 |
| 2.434734306532077 | -0.503 | 0.073 | 0.179 |
| 2.437875899185667 | -0.514 | 0.069 | 0.177 |
| 2.441017491839256 | -0.525 | 0.066 | 0.175 |
| 2.444159084492846 | -0.536 | 0.063 | 0.173 |
| 2.447300677146435 | -0.547 | 0.059 | 0.171 |
| 2.450442269800025 | -0.558 | 0.056 | 0.169 |
| 2.453583862453615 | -0.57 | 0.052 | 0.167 |
| 2.456725455107204 | -0.581 | 0.049 | 0.165 |
| 2.459867047760794 | -0.593 | 0.045 | 0.163 |
| 2.463008640414384 | -0.606 | 0.042 | 0.161 |
| 2.466150233067973 | -0.618 | 0.038 | 0.158 |
| 2.469291825721563 | -0.631 | 0.035 | 0.156 |
| 2.472433418375152 | -0.644 | 0.031 | 0.154 |
| 2.475575011028742 | -0.657 | 0.027 | 0.152 |
| 2.478716603682332 | -0.67 | 0.024 | 0.15 |
| 2.481858196335921 | -0.684 | 0.02 | 0.148 |
| 2.48499978898951 | -0.698 | 0.016 | 0.146 |
| 2.4881413816431 | -0.712 | 0.012 | 0.143 |
| 2.49128297429669 | -0.727 | 0.008 | 0.141 |
| 2.49442456695028 | -0.742 | 0.005 | 0.139 |
| 2.497566159603869 | -0.758 | 0.001 | 0.137 |
| 2.500707752257458 | -0.774 | -0.003 | 0.135 |
| 2.503849344911048 | -0.79 | -0.007 | 0.132 |
| 2.506990937564638 | -0.807 | -0.011 | 0.13 |
| 2.510132530218228 | -0.824 | -0.015 | 0.128 |
| 2.513274122871817 | -0.841 | -0.019 | 0.125 |
| 2.516415715525407 | -0.859 | -0.024 | 0.123 |
| 2.519557308178996 | -0.878 | -0.028 | 0.121 |
| 2.522698900832586 | -0.897 | -0.032 | 0.118 |
| 2.525840493486176 | -0.917 | -0.036 | 0.116 |
| 2.528982086139765 | -0.938 | -0.041 | 0.114 |
| 2.532123678793355 | -0.959 | -0.045 | 0.111 |
| 2.535265271446944 | -0.981 | -0.049 | 0.109 |
| 2.538406864100534 | -1.004 | -0.054 | 0.106 |
| 2.541548456754124 | -1.028 | -0.058 | 0.104 |
| 2.544690049407713 | -1.053 | -0.063 | 0.101 |
| 2.547831642061302 | -1.079 | -0.067 | 0.099 |
| 2.550973234714892 | -1.106 | -0.072 | 0.096 |
| 2.554114827368482 | -1.134 | -0.077 | 0.094 |
| 2.557256420022072 | -1.164 | -0.082 | 0.091 |
| 2.560398012675661 | -1.195 | -0.086 | 0.088 |
| 2.563539605329251 | -1.228 | -0.091 | 0.086 |
| 2.56668119798284 | -1.263 | -0.096 | 0.083 |
| 2.56982279063643 | -1.3 | -0.101 | 0.08 |
| 2.57296438329002 | -1.339 | -0.106 | 0.078 |
| 2.576105975943609 | -1.381 | -0.111 | 0.075 |
| 2.579247568597199 | -1.427 | -0.117 | 0.072 |
| 2.582389161250788 | -1.476 | -0.122 | 0.069 |
| 2.585530753904377 | -1.53 | -0.127 | 0.067 |
| 2.588672346557967 | -1.59 | -0.133 | 0.064 |
| 2.591813939211557 | -1.656 | -0.138 | 0.061 |
| 2.594955531865147 | -1.73 | -0.144 | 0.058 |
| 2.598097124518736 | -1.815 | -0.149 | 0.055 |
| 2.601238717172326 | -1.915 | -0.155 | 0.052 |
| 2.604380309825915 | -2.035 | -0.161 | 0.049 |
| 2.607521902479505 | -2.187 | -0.167 | 0.046 |
| 2.610663495133095 | -2.394 | -0.173 | 0.043 |
| 2.613805087786684 | -2.717 | -0.179 | 0.04 |
| 2.616946680440274 | -3.518 | -0.185 | 0.037 |
| 2.620088273093863 | -3.119 | -0.191 | 0.034 |
| 2.623229865747452 | -2.59 | -0.198 | 0.03 |
| 2.626371458401042 | -2.319 | -0.204 | 0.027 |
| 2.629513051054632 | -2.136 | -0.211 | 0.024 |
| 2.632654643708222 | -1.997 | -0.218 | 0.021 |
| 2.635796236361811 | -1.886 | -0.225 | 0.017 |
| 2.638937829015401 | -1.792 | -0.232 | 0.014 |
| 2.642079421668991 | -1.712 | -0.239 | 0.011 |
| 2.64522101432258 | -1.642 | -0.246 | 0.007 |
| 2.64836260697617 | -1.579 | -0.253 | 0.004 |
| 2.651504199629759 | -1.523 | -0.261 | 0 |
| 2.654645792283349 | -1.472 | -0.269 | -0.003 |
| 2.657787384936938 | -1.425 | -0.277 | -0.007 |
| 2.660928977590528 | -1.381 | -0.285 | -0.011 |
| 2.664070570244118 | -1.341 | -0.293 | -0.014 |
| 2.667212162897707 | -1.304 | -0.301 | -0.018 |
| 2.670353755551297 | -1.268 | -0.31 | -0.022 |
| 2.673495348204887 | -1.235 | -0.319 | -0.026 |
| 2.676636940858476 | -1.204 | -0.327 | -0.03 |
| 2.679778533512066 | -1.174 | -0.337 | -0.034 |
| 2.682920126165655 | -1.146 | -0.346 | -0.038 |
| 2.686061718819245 | -1.119 | -0.356 | -0.042 |
| 2.689203311472835 | -1.094 | -0.366 | -0.046 |
| 2.692344904126424 | -1.069 | -0.376 | -0.05 |
| 2.695486496780014 | -1.046 | -0.387 | -0.055 |
| 2.698628089433603 | -1.023 | -0.397 | -0.059 |
| 2.701769682087193 | -1.002 | -0.409 | -0.063 |
| 2.704911274740782 | -0.981 | -0.42 | -0.068 |
| 2.708052867394372 | -0.961 | -0.432 | -0.073 |
| 2.711194460047962 | -0.942 | -0.444 | -0.077 |
| 2.714336052701551 | -0.923 | -0.457 | -0.082 |
| 2.717477645355141 | -0.905 | -0.47 | -0.087 |
| 2.720619238008731 | -0.888 | -0.484 | -0.092 |
| 2.72376083066232 | -0.871 | -0.498 | -0.097 |
| 2.72690242331591 | -0.854 | -0.513 | -0.102 |
| 2.730044015969499 | -0.838 | -0.528 | -0.107 |
| 2.733185608623089 | -0.823 | -0.544 | -0.112 |
| 2.736327201276678 | -0.808 | -0.561 | -0.118 |
| 2.739468793930268 | -0.793 | -0.578 | -0.123 |
| 2.742610386583858 | -0.779 | -0.597 | -0.129 |
| 2.745751979237447 | -0.765 | -0.616 | -0.134 |
| 2.748893571891036 | -0.751 | -0.637 | -0.14 |
| 2.752035164544627 | -0.738 | -0.659 | -0.146 |
| 2.755176757198216 | -0.725 | -0.682 | -0.152 |
| 2.758318349851806 | -0.713 | -0.707 | -0.159 |
| 2.761459942505395 | -0.7 | -0.734 | -0.165 |
| 2.764601535158985 | -0.688 | -0.763 | -0.172 |
| 2.767743127812574 | -0.676 | -0.794 | -0.178 |
| 2.770884720466164 | -0.665 | -0.829 | -0.185 |
| 2.774026313119754 | -0.654 | -0.867 | -0.192 |
| 2.777167905773343 | -0.643 | -0.91 | -0.2 |
| 2.780309498426932 | -0.632 | -0.958 | -0.207 |
| 2.783451091080522 | -0.621 | -1.014 | -0.215 |
| 2.786592683734112 | -0.611 | -1.081 | -0.223 |
| 2.789734276387701 | -0.601 | -1.163 | -0.231 |
| 2.792875869041291 | -0.591 | -1.271 | -0.239 |
| 2.796017461694881 | -0.581 | -1.425 | -0.248 |
| 2.79915905434847 | -0.571 | -1.706 | -0.257 |
| 2.80230064700206 | -0.562 | -2.258 | -0.266 |
| 2.80544223965565 | -0.552 | -1.582 | -0.276 |
| 2.808583832309239 | -0.543 | -1.365 | -0.286 |
| 2.811725424962829 | -0.534 | -1.231 | -0.297 |
| 2.814867017616419 | -0.525 | -1.134 | -0.307 |
| 2.818008610270008 | -0.517 | -1.058 | -0.319 |
| 2.821150202923598 | -0.508 | -0.996 | -0.33 |
| 2.824291795577187 | -0.5 | -0.943 | -0.343 |
| 2.827433388230777 | -0.491 | -0.897 | -0.356 |
| 2.830574980884366 | -0.483 | -0.857 | -0.37 |
| 2.833716573537956 | -0.475 | -0.82 | -0.384 |
| 2.836858166191546 | -0.467 | -0.787 | -0.399 |
| 2.839999758845135 | -0.459 | -0.757 | -0.415 |
| 2.843141351498725 | -0.452 | -0.73 | -0.433 |
| 2.846282944152314 | -0.444 | -0.704 | -0.451 |
| 2.849424536805904 | -0.437 | -0.68 | -0.471 |
| 2.852566129459494 | -0.429 | -0.658 | -0.492 |
| 2.855707722113083 | -0.422 | -0.637 | -0.516 |
| 2.858849314766673 | -0.415 | -0.617 | -0.542 |
| 2.861990907420262 | -0.408 | -0.598 | -0.57 |
| 2.865132500073852 | -0.401 | -0.58 | -0.602 |
| 2.868274092727442 | -0.394 | -0.563 | -0.639 |
| 2.871415685381031 | -0.387 | -0.547 | -0.682 |
| 2.874557278034621 | -0.381 | -0.532 | -0.733 |
| 2.87769887068821 | -0.374 | -0.517 | -0.797 |
| 2.8808404633418 | -0.367 | -0.503 | -0.882 |
| 2.88398205599539 | -0.361 | -0.489 | -1.009 |
| 2.88712364864898 | -0.355 | -0.476 | -1.271 |
| 2.890265241302569 | -0.348 | -0.464 | -2.1 |
| 2.893406833956158 | -0.342 | -0.451 | -1.034 |
| 2.896548426609748 | -0.336 | -0.44 | -0.897 |
| 2.899690019263338 | -0.33 | -0.428 | -0.808 |
| 2.902831611916927 | -0.324 | -0.417 | -0.742 |
| 2.905973204570517 | -0.318 | -0.407 | -0.69 |
| 2.909114797224106 | -0.312 | -0.396 | -0.646 |
| 2.912256389877696 | -0.306 | -0.386 | -0.609 |
| 2.915397982531286 | -0.301 | -0.377 | -0.576 |
| 2.918539575184875 | -0.295 | -0.367 | -0.547 |
| 2.921681167838465 | -0.289 | -0.358 | -0.522 |
| 2.924822760492054 | -0.284 | -0.349 | -0.498 |
| 2.927964353145644 | -0.278 | -0.34 | -0.476 |
| 2.931105945799234 | -0.273 | -0.332 | -0.457 |
| 2.934247538452823 | -0.267 | -0.323 | -0.438 |
| 2.937389131106413 | -0.262 | -0.315 | -0.421 |
| 2.940530723760002 | -0.257 | -0.307 | -0.405 |
| 2.943672316413592 | -0.252 | -0.3 | -0.39 |
| 2.946813909067182 | -0.247 | -0.292 | -0.375 |
| 2.949955501720771 | -0.241 | -0.285 | -0.362 |
| 2.953097094374361 | -0.236 | -0.277 | -0.349 |
| 2.95623868702795 | -0.231 | -0.27 | -0.337 |
| 2.95938027968154 | -0.226 | -0.263 | -0.325 |
| 2.96252187233513 | -0.222 | -0.256 | -0.314 |
| 2.965663464988719 | -0.217 | -0.25 | -0.303 |
| 2.968805057642309 | -0.212 | -0.243 | -0.293 |
| 2.971946650295898 | -0.207 | -0.237 | -0.283 |
| 2.975088242949488 | -0.202 | -0.23 | -0.273 |
| 2.978229835603078 | -0.198 | -0.224 | -0.264 |
| 2.981371428256667 | -0.193 | -0.218 | -0.256 |
| 2.984513020910257 | -0.188 | -0.212 | -0.247 |
| 2.987654613563846 | -0.184 | -0.206 | -0.239 |
| 2.990796206217436 | -0.179 | -0.201 | -0.231 |
| 2.993937798871025 | -0.175 | -0.195 | -0.223 |
| 2.997079391524615 | -0.17 | -0.189 | -0.215 |
| 3.000220984178205 | -0.166 | -0.184 | -0.208 |
| 3.003362576831794 | -0.162 | -0.178 | -0.201 |
| 3.006504169485384 | -0.157 | -0.173 | -0.194 |
| 3.009645762138974 | -0.153 | -0.168 | -0.187 |
| 3.012787354792563 | -0.149 | -0.163 | -0.181 |
| 3.015928947446153 | -0.145 | -0.158 | -0.174 |
| 3.019070540099742 | -0.141 | -0.153 | -0.168 |
| 3.022212132753332 | -0.136 | -0.148 | -0.162 |
| 3.025353725406922 | -0.132 | -0.143 | -0.156 |
| 3.028495318060511 | -0.128 | -0.138 | -0.15 |
| 3.031636910714101 | -0.124 | -0.133 | -0.145 |
| 3.03477850336769 | -0.12 | -0.129 | -0.139 |
| 3.03792009602128 | -0.116 | -0.124 | -0.134 |
| 3.04106168867487 | -0.112 | -0.12 | -0.129 |
| 3.04420328132846 | -0.108 | -0.115 | -0.123 |
| 3.047344873982049 | -0.104 | -0.111 | -0.118 |
| 3.050486466635638 | -0.101 | -0.106 | -0.113 |
| 3.053628059289228 | -0.097 | -0.102 | -0.108 |
| 3.056769651942818 | -0.093 | -0.098 | -0.104 |
| 3.059911244596407 | -0.089 | -0.094 | -0.099 |
| 3.063052837249997 | -0.085 | -0.09 | -0.094 |
| 3.066194429903586 | -0.082 | -0.085 | -0.09 |
| 3.069336022557176 | -0.078 | -0.081 | -0.085 |
| 3.072477615210766 | -0.074 | -0.077 | -0.081 |
| 3.075619207864355 | -0.071 | -0.074 | -0.077 |
| 3.078760800517945 | -0.067 | -0.07 | -0.072 |
| 3.081902393171534 | -0.064 | -0.066 | -0.068 |
| 3.085043985825124 | -0.06 | -0.062 | -0.064 |
| 3.088185578478713 | -0.056 | -0.058 | -0.06 |
| 3.091327171132303 | -0.053 | -0.054 | -0.056 |
| 3.094468763785893 | -0.049 | -0.051 | -0.052 |
| 3.097610356439482 | -0.046 | -0.047 | -0.048 |
| 3.100751949093072 | -0.043 | -0.044 | -0.045 |
| 3.103893541746661 | -0.039 | -0.04 | -0.041 |
| 3.107035134400251 | -0.036 | -0.036 | -0.037 |
| 3.110176727053841 | -0.032 | -0.033 | -0.034 |
| 3.11331831970743 | -0.029 | -0.03 | -0.03 |
| 3.11645991236102 | -0.026 | -0.026 | -0.026 |
| 3.11960150501461 | -0.022 | -0.023 | -0.023 |
| 3.122743097668199 | -0.019 | -0.019 | -0.02 |
| 3.125884690321789 | -0.016 | -0.016 | -0.016 |
| 3.129026282975378 | -0.013 | -0.013 | -0.013 |
| 3.132167875628968 | -0.01 | -0.01 | -0.01 |
| 3.135309468282557 | -0.006 | -0.006 | -0.006 |
| 3.138451060936147 | -0.003 | -0.003 | -0.003 |
| 3.141592653589737 | 0 | 0 | 0 |
| 3.144734246243326 | 0.003 | 0.003 | 0.003 |
| 3.147875838896916 | 0.006 | 0.006 | 0.006 |
| 3.151017431550505 | 0.009 | 0.009 | 0.009 |
| 3.154159024204095 | 0.012 | 0.012 | 0.012 |
| 3.157300616857685 | 0.015 | 0.015 | 0.015 |
| 3.160442209511274 | 0.019 | 0.018 | 0.018 |
| 3.163583802164864 | 0.022 | 0.021 | 0.021 |
| 3.166725394818453 | 0.025 | 0.024 | 0.024 |
| 3.169866987472043 | 0.028 | 0.027 | 0.027 |
| 3.173008580125633 | 0.03 | 0.03 | 0.03 |
| 3.176150172779222 | 0.033 | 0.033 | 0.032 |
| 3.179291765432812 | 0.036 | 0.036 | 0.035 |
| 3.182433358086401 | 0.039 | 0.039 | 0.038 |
| 3.185574950739991 | 0.042 | 0.041 | 0.041 |
| 3.188716543393581 | 0.045 | 0.044 | 0.043 |
| 3.19185813604717 | 0.048 | 0.047 | 0.046 |
| 3.19499972870076 | 0.051 | 0.05 | 0.048 |
| 3.198141321354349 | 0.054 | 0.052 | 0.051 |
| 3.20128291400794 | 0.056 | 0.055 | 0.054 |
| 3.204424506661528 | 0.059 | 0.058 | 0.056 |
| 3.207566099315118 | 0.062 | 0.06 | 0.059 |
| 3.210707691968708 | 0.065 | 0.063 | 0.061 |
| 3.213849284622297 | 0.067 | 0.065 | 0.063 |
| 3.216990877275887 | 0.07 | 0.068 | 0.066 |
| 3.220132469929476 | 0.073 | 0.071 | 0.068 |
| 3.223274062583066 | 0.076 | 0.073 | 0.071 |
| 3.226415655236656 | 0.078 | 0.076 | 0.073 |
| 3.229557247890245 | 0.081 | 0.078 | 0.075 |
| 3.232698840543835 | 0.084 | 0.081 | 0.078 |
| 3.235840433197425 | 0.086 | 0.083 | 0.08 |
| 3.238982025851014 | 0.089 | 0.085 | 0.082 |
| 3.242123618504604 | 0.092 | 0.088 | 0.085 |
| 3.245265211158193 | 0.094 | 0.09 | 0.087 |
| 3.248406803811783 | 0.097 | 0.093 | 0.089 |
| 3.251548396465373 | 0.099 | 0.095 | 0.091 |
| 3.254689989118962 | 0.102 | 0.097 | 0.093 |
| 3.257831581772551 | 0.105 | 0.1 | 0.095 |
| 3.260973174426141 | 0.107 | 0.102 | 0.098 |
| 3.26411476707973 | 0.11 | 0.104 | 0.1 |
| 3.267256359733321 | 0.112 | 0.107 | 0.102 |
| 3.27039795238691 | 0.115 | 0.109 | 0.104 |
| 3.2735395450405 | 0.117 | 0.111 | 0.106 |
| 3.276681137694089 | 0.12 | 0.113 | 0.108 |
| 3.279822730347679 | 0.122 | 0.116 | 0.11 |
| 3.282964323001269 | 0.125 | 0.118 | 0.112 |
| 3.286105915654858 | 0.127 | 0.12 | 0.114 |
| 3.289247508308448 | 0.129 | 0.122 | 0.116 |
| 3.292389100962037 | 0.132 | 0.124 | 0.118 |
| 3.295530693615627 | 0.134 | 0.127 | 0.12 |
| 3.298672286269217 | 0.137 | 0.129 | 0.122 |
| 3.301813878922806 | 0.139 | 0.131 | 0.124 |
| 3.304955471576396 | 0.141 | 0.133 | 0.126 |
| 3.308097064229985 | 0.144 | 0.135 | 0.128 |
| 3.311238656883575 | 0.146 | 0.137 | 0.13 |
| 3.314380249537165 | 0.148 | 0.139 | 0.131 |
| 3.317521842190754 | 0.151 | 0.141 | 0.133 |
| 3.320663434844344 | 0.153 | 0.143 | 0.135 |
| 3.323805027497933 | 0.155 | 0.145 | 0.137 |
| 3.326946620151523 | 0.158 | 0.147 | 0.139 |
| 3.330088212805113 | 0.16 | 0.149 | 0.141 |
| 3.333229805458702 | 0.162 | 0.151 | 0.142 |
| 3.336371398112292 | 0.165 | 0.153 | 0.144 |
| 3.339512990765881 | 0.167 | 0.155 | 0.146 |
| 3.342654583419471 | 0.169 | 0.157 | 0.148 |
| 3.345796176073061 | 0.171 | 0.159 | 0.149 |
| 3.34893776872665 | 0.174 | 0.161 | 0.151 |
| 3.35207936138024 | 0.176 | 0.163 | 0.153 |
| 3.355220954033829 | 0.178 | 0.165 | 0.155 |
| 3.358362546687419 | 0.18 | 0.167 | 0.156 |
| 3.361504139341009 | 0.182 | 0.169 | 0.158 |
| 3.364645731994598 | 0.185 | 0.171 | 0.16 |
| 3.367787324648188 | 0.187 | 0.173 | 0.161 |
| 3.370928917301777 | 0.189 | 0.175 | 0.163 |
| 3.374070509955367 | 0.191 | 0.177 | 0.165 |
| 3.377212102608956 | 0.193 | 0.178 | 0.166 |
| 3.380353695262546 | 0.195 | 0.18 | 0.168 |
| 3.383495287916136 | 0.197 | 0.182 | 0.169 |
| 3.386636880569725 | 0.2 | 0.184 | 0.171 |
| 3.389778473223315 | 0.202 | 0.186 | 0.173 |
| 3.392920065876904 | 0.204 | 0.187 | 0.174 |
| 3.396061658530494 | 0.206 | 0.189 | 0.176 |
| 3.399203251184084 | 0.208 | 0.191 | 0.177 |
| 3.402344843837673 | 0.21 | 0.193 | 0.179 |
| 3.405486436491263 | 0.212 | 0.195 | 0.18 |
| 3.408628029144852 | 0.214 | 0.196 | 0.182 |
| 3.411769621798442 | 0.216 | 0.198 | 0.183 |
| 3.414911214452032 | 0.218 | 0.2 | 0.185 |
| 3.418052807105621 | 0.22 | 0.202 | 0.186 |
| 3.421194399759211 | 0.222 | 0.203 | 0.188 |
| 3.4243359924128 | 0.224 | 0.205 | 0.189 |
| 3.42747758506639 | 0.226 | 0.207 | 0.191 |
| 3.43061917771998 | 0.228 | 0.208 | 0.192 |
| 3.433760770373569 | 0.23 | 0.21 | 0.194 |
| 3.436902363027159 | 0.232 | 0.212 | 0.195 |
| 3.440043955680748 | 0.234 | 0.213 | 0.197 |
| 3.443185548334338 | 0.236 | 0.215 | 0.198 |
| 3.446327140987927 | 0.238 | 0.217 | 0.2 |
| 3.449468733641517 | 0.24 | 0.218 | 0.201 |
| 3.452610326295107 | 0.242 | 0.22 | 0.202 |
| 3.455751918948696 | 0.244 | 0.222 | 0.204 |
| 3.458893511602286 | 0.246 | 0.223 | 0.205 |
| 3.462035104255876 | 0.248 | 0.225 | 0.207 |
| 3.465176696909465 | 0.25 | 0.227 | 0.208 |
| 3.468318289563055 | 0.252 | 0.228 | 0.209 |
| 3.471459882216644 | 0.254 | 0.23 | 0.211 |
| 3.474601474870234 | 0.256 | 0.231 | 0.212 |
| 3.477743067523824 | 0.258 | 0.233 | 0.214 |
| 3.480884660177413 | 0.259 | 0.235 | 0.215 |
| 3.484026252831002 | 0.261 | 0.236 | 0.216 |
| 3.487167845484592 | 0.263 | 0.238 | 0.218 |
| 3.490309438138182 | 0.265 | 0.239 | 0.219 |
| 3.493451030791772 | 0.267 | 0.241 | 0.22 |
| 3.496592623445361 | 0.269 | 0.242 | 0.222 |
| 3.499734216098951 | 0.271 | 0.244 | 0.223 |
| 3.50287580875254 | 0.272 | 0.245 | 0.224 |
| 3.50601740140613 | 0.274 | 0.247 | 0.225 |
| 3.50915899405972 | 0.276 | 0.248 | 0.227 |
| 3.512300586713309 | 0.278 | 0.25 | 0.228 |
| 3.515442179366899 | 0.28 | 0.251 | 0.229 |
| 3.518583772020488 | 0.282 | 0.253 | 0.231 |
| 3.521725364674078 | 0.283 | 0.254 | 0.232 |
| 3.524866957327668 | 0.285 | 0.256 | 0.233 |
| 3.528008549981257 | 0.287 | 0.257 | 0.234 |
| 3.531150142634847 | 0.289 | 0.259 | 0.236 |
| 3.534291735288436 | 0.291 | 0.26 | 0.237 |
| 3.537433327942026 | 0.292 | 0.262 | 0.238 |
| 3.540574920595616 | 0.294 | 0.263 | 0.239 |
| 3.543716513249205 | 0.296 | 0.265 | 0.241 |
| 3.546858105902795 | 0.298 | 0.266 | 0.242 |
| 3.549999698556384 | 0.299 | 0.268 | 0.243 |
| 3.553141291209974 | 0.301 | 0.269 | 0.244 |
| 3.556282883863564 | 0.303 | 0.27 | 0.245 |
| 3.559424476517153 | 0.305 | 0.272 | 0.247 |
| 3.562566069170743 | 0.306 | 0.273 | 0.248 |
| 3.565707661824332 | 0.308 | 0.275 | 0.249 |
| 3.568849254477922 | 0.31 | 0.276 | 0.25 |
| 3.571990847131511 | 0.312 | 0.277 | 0.251 |
| 3.575132439785101 | 0.313 | 0.279 | 0.253 |
| 3.578274032438691 | 0.315 | 0.28 | 0.254 |
| 3.58141562509228 | 0.317 | 0.282 | 0.255 |
| 3.58455721774587 | 0.318 | 0.283 | 0.256 |
| 3.58769881039946 | 0.32 | 0.284 | 0.257 |
| 3.590840403053049 | 0.322 | 0.286 | 0.258 |
| 3.593981995706639 | 0.323 | 0.287 | 0.259 |
| 3.597123588360228 | 0.325 | 0.288 | 0.261 |
| 3.600265181013818 | 0.327 | 0.29 | 0.262 |
| 3.603406773667407 | 0.328 | 0.291 | 0.263 |
| 3.606548366320997 | 0.33 | 0.292 | 0.264 |
| 3.609689958974587 | 0.332 | 0.294 | 0.265 |
| 3.612831551628176 | 0.333 | 0.295 | 0.266 |
| 3.615973144281766 | 0.335 | 0.296 | 0.267 |
| 3.619114736935355 | 0.337 | 0.298 | 0.268 |
| 3.622256329588945 | 0.338 | 0.299 | 0.27 |
| 3.625397922242534 | 0.34 | 0.3 | 0.271 |
| 3.628539514896124 | 0.342 | 0.302 | 0.272 |
| 3.631681107549714 | 0.343 | 0.303 | 0.273 |
| 3.634822700203303 | 0.345 | 0.304 | 0.274 |
| 3.637964292856893 | 0.346 | 0.306 | 0.275 |
| 3.641105885510483 | 0.348 | 0.307 | 0.276 |
| 3.644247478164072 | 0.35 | 0.308 | 0.277 |
| 3.647389070817662 | 0.351 | 0.31 | 0.278 |
| 3.650530663471251 | 0.353 | 0.311 | 0.279 |
| 3.653672256124841 | 0.354 | 0.312 | 0.28 |
| 3.656813848778431 | 0.356 | 0.313 | 0.281 |
| 3.65995544143202 | 0.358 | 0.315 | 0.283 |
| 3.66309703408561 | 0.359 | 0.316 | 0.284 |
| 3.666238626739199 | 0.361 | 0.317 | 0.285 |
| 3.66938021939279 | 0.362 | 0.318 | 0.286 |
| 3.672521812046378 | 0.364 | 0.32 | 0.287 |
| 3.675663404699968 | 0.365 | 0.321 | 0.288 |
| 3.678804997353558 | 0.367 | 0.322 | 0.289 |
| 3.681946590007147 | 0.368 | 0.323 | 0.29 |
| 3.685088182660737 | 0.37 | 0.325 | 0.291 |
| 3.688229775314326 | 0.372 | 0.326 | 0.292 |
| 3.691371367967916 | 0.373 | 0.327 | 0.293 |
| 3.694512960621506 | 0.375 | 0.328 | 0.294 |
| 3.697654553275095 | 0.376 | 0.329 | 0.295 |
| 3.700796145928685 | 0.378 | 0.331 | 0.296 |
| 3.703937738582274 | 0.379 | 0.332 | 0.297 |
| 3.707079331235864 | 0.381 | 0.333 | 0.298 |
| 3.710220923889454 | 0.382 | 0.334 | 0.299 |
| 3.713362516543043 | 0.384 | 0.335 | 0.3 |
| 3.716504109196633 | 0.385 | 0.337 | 0.301 |
| 3.719645701850223 | 0.387 | 0.338 | 0.302 |
| 3.722787294503812 | 0.388 | 0.339 | 0.303 |
| 3.725928887157402 | 0.39 | 0.34 | 0.304 |
| 3.729070479810991 | 0.391 | 0.341 | 0.305 |
| 3.732212072464581 | 0.393 | 0.343 | 0.306 |
| 3.735353665118171 | 0.394 | 0.344 | 0.307 |
| 3.73849525777176 | 0.396 | 0.345 | 0.308 |
| 3.74163685042535 | 0.397 | 0.346 | 0.309 |
| 3.744778443078939 | 0.399 | 0.347 | 0.31 |
| 3.747920035732529 | 0.4 | 0.348 | 0.311 |
| 3.751061628386119 | 0.402 | 0.35 | 0.312 |
| 3.754203221039708 | 0.403 | 0.351 | 0.313 |
| 3.757344813693298 | 0.405 | 0.352 | 0.313 |
| 3.760486406346887 | 0.406 | 0.353 | 0.314 |
| 3.763627999000477 | 0.407 | 0.354 | 0.315 |
| 3.766769591654067 | 0.409 | 0.355 | 0.316 |
| 3.769911184307656 | 0.41 | 0.356 | 0.317 |
| 3.773052776961246 | 0.412 | 0.358 | 0.318 |
| 3.776194369614835 | 0.413 | 0.359 | 0.319 |
| 3.779335962268425 | 0.415 | 0.36 | 0.32 |
| 3.782477554922014 | 0.416 | 0.361 | 0.321 |
| 3.785619147575604 | 0.417 | 0.362 | 0.322 |
| 3.788760740229193 | 0.419 | 0.363 | 0.323 |
| 3.791902332882783 | 0.42 | 0.364 | 0.324 |
| 3.795043925536373 | 0.422 | 0.365 | 0.325 |
| 3.798185518189962 | 0.423 | 0.367 | 0.326 |
| 3.801327110843552 | 0.425 | 0.368 | 0.327 |
| 3.804468703497142 | 0.426 | 0.369 | 0.327 |
| 3.807610296150731 | 0.427 | 0.37 | 0.328 |
| 3.810751888804321 | 0.429 | 0.371 | 0.329 |
| 3.813893481457911 | 0.43 | 0.372 | 0.33 |
| 3.8170350741115 | 0.432 | 0.373 | 0.331 |
| 3.82017666676509 | 0.433 | 0.374 | 0.332 |
| 3.823318259418679 | 0.434 | 0.375 | 0.333 |
| 3.826459852072269 | 0.436 | 0.376 | 0.334 |
| 3.829601444725859 | 0.437 | 0.378 | 0.335 |
| 3.832743037379448 | 0.439 | 0.379 | 0.335 |
| 3.835884630033038 | 0.44 | 0.38 | 0.336 |
| 3.839026222686627 | 0.441 | 0.381 | 0.337 |
| 3.842167815340217 | 0.443 | 0.382 | 0.338 |
| 3.845309407993807 | 0.444 | 0.383 | 0.339 |
| 3.848451000647396 | 0.445 | 0.384 | 0.34 |
| 3.851592593300986 | 0.447 | 0.385 | 0.341 |
| 3.854734185954575 | 0.448 | 0.386 | 0.342 |
| 3.857875778608165 | 0.45 | 0.387 | 0.342 |
| 3.861017371261755 | 0.451 | 0.388 | 0.343 |
| 3.864158963915344 | 0.452 | 0.389 | 0.344 |
| 3.867300556568933 | 0.454 | 0.39 | 0.345 |
| 3.870442149222523 | 0.455 | 0.391 | 0.346 |
| 3.873583741876112 | 0.456 | 0.392 | 0.347 |
| 3.876725334529703 | 0.458 | 0.393 | 0.348 |
| 3.879866927183292 | 0.459 | 0.395 | 0.348 |
| 3.883008519836882 | 0.46 | 0.396 | 0.349 |
| 3.886150112490471 | 0.462 | 0.397 | 0.35 |
| 3.889291705144061 | 0.463 | 0.398 | 0.351 |
| 3.892433297797651 | 0.464 | 0.399 | 0.352 |
| 3.89557489045124 | 0.466 | 0.4 | 0.353 |
| 3.89871648310483 | 0.467 | 0.401 | 0.354 |
| 3.901858075758419 | 0.468 | 0.402 | 0.354 |
| 3.904999668412009 | 0.47 | 0.403 | 0.355 |
| 3.908141261065598 | 0.471 | 0.404 | 0.356 |
| 3.911282853719188 | 0.472 | 0.405 | 0.357 |
| 3.914424446372778 | 0.474 | 0.406 | 0.358 |
| 3.917566039026367 | 0.475 | 0.407 | 0.359 |
| 3.920707631679957 | 0.476 | 0.408 | 0.359 |
| 3.923849224333547 | 0.477 | 0.409 | 0.36 |
| 3.926990816987136 | 0.479 | 0.41 | 0.361 |
| 3.930132409640726 | 0.48 | 0.411 | 0.362 |
| 3.933274002294315 | 0.481 | 0.412 | 0.363 |
| 3.936415594947905 | 0.483 | 0.413 | 0.363 |
| 3.939557187601495 | 0.484 | 0.414 | 0.364 |
| 3.942698780255084 | 0.485 | 0.415 | 0.365 |
| 3.945840372908674 | 0.487 | 0.416 | 0.366 |
| 3.948981965562263 | 0.488 | 0.417 | 0.367 |
| 3.952123558215853 | 0.489 | 0.418 | 0.368 |
| 3.955265150869442 | 0.49 | 0.419 | 0.368 |
| 3.958406743523032 | 0.492 | 0.42 | 0.369 |
| 3.961548336176622 | 0.493 | 0.421 | 0.37 |
| 3.964689928830211 | 0.494 | 0.422 | 0.371 |
| 3.967831521483801 | 0.495 | 0.423 | 0.372 |
| 3.97097311413739 | 0.497 | 0.424 | 0.372 |
| 3.97411470679098 | 0.498 | 0.425 | 0.373 |
| 3.97725629944457 | 0.499 | 0.426 | 0.374 |
| 3.98039789209816 | 0.501 | 0.427 | 0.375 |
| 3.983539484751749 | 0.502 | 0.428 | 0.376 |
| 3.986681077405338 | 0.503 | 0.429 | 0.376 |
| 3.989822670058928 | 0.504 | 0.43 | 0.377 |
| 3.992964262712517 | 0.506 | 0.431 | 0.378 |
| 3.996105855366107 | 0.507 | 0.432 | 0.379 |
| 3.999247448019697 | 0.508 | 0.432 | 0.379 |
| 4.002389040673287 | 0.509 | 0.433 | 0.38 |
| 4.005530633326877 | 0.511 | 0.434 | 0.381 |
| 4.008672225980466 | 0.512 | 0.435 | 0.382 |
| 4.011813818634056 | 0.513 | 0.436 | 0.383 |
| 4.014955411287645 | 0.514 | 0.437 | 0.383 |
| 4.018097003941234 | 0.516 | 0.438 | 0.384 |
| 4.021238596594824 | 0.517 | 0.439 | 0.385 |
| 4.024380189248414 | 0.518 | 0.44 | 0.386 |
| 4.027521781902004 | 0.519 | 0.441 | 0.386 |
| 4.030663374555593 | 0.52 | 0.442 | 0.387 |
| 4.033804967209183 | 0.522 | 0.443 | 0.388 |
| 4.036946559862773 | 0.523 | 0.444 | 0.389 |
| 4.040088152516362 | 0.524 | 0.445 | 0.389 |
| 4.043229745169951 | 0.525 | 0.446 | 0.39 |
| 4.046371337823541 | 0.527 | 0.447 | 0.391 |
| 4.049512930477131 | 0.528 | 0.448 | 0.392 |
| 4.05265452313072 | 0.529 | 0.449 | 0.392 |
| 4.05579611578431 | 0.53 | 0.45 | 0.393 |
| 4.0589377084379 | 0.531 | 0.45 | 0.394 |
| 4.062079301091489 | 0.533 | 0.451 | 0.395 |
| 4.065220893745079 | 0.534 | 0.452 | 0.395 |
| 4.068362486398668 | 0.535 | 0.453 | 0.396 |
| 4.071504079052258 | 0.536 | 0.454 | 0.397 |
| 4.074645671705848 | 0.538 | 0.455 | 0.398 |
| 4.077787264359437 | 0.539 | 0.456 | 0.398 |
| 4.080928857013027 | 0.54 | 0.457 | 0.399 |
| 4.084070449666616 | 0.541 | 0.458 | 0.4 |
| 4.087212042320206 | 0.542 | 0.459 | 0.401 |
| 4.090353634973795 | 0.544 | 0.46 | 0.401 |
| 4.093495227627385 | 0.545 | 0.461 | 0.402 |
| 4.096636820280975 | 0.546 | 0.461 | 0.403 |
| 4.099778412934564 | 0.547 | 0.462 | 0.404 |
| 4.102920005588154 | 0.548 | 0.463 | 0.404 |
| 4.106061598241744 | 0.549 | 0.464 | 0.405 |
| 4.109203190895333 | 0.551 | 0.465 | 0.406 |
| 4.112344783548923 | 0.552 | 0.466 | 0.407 |
| 4.115486376202512 | 0.553 | 0.467 | 0.407 |
| 4.118627968856102 | 0.554 | 0.468 | 0.408 |
| 4.121769561509692 | 0.555 | 0.469 | 0.409 |
| 4.124911154163281 | 0.557 | 0.47 | 0.409 |
| 4.128052746816871 | 0.558 | 0.471 | 0.41 |
| 4.13119433947046 | 0.559 | 0.471 | 0.411 |
| 4.13433593212405 | 0.56 | 0.472 | 0.412 |
| 4.13747752477764 | 0.561 | 0.473 | 0.412 |
| 4.14061911743123 | 0.562 | 0.474 | 0.413 |
| 4.143760710084818 | 0.564 | 0.475 | 0.414 |
| 4.146902302738408 | 0.565 | 0.476 | 0.415 |
| 4.150043895391998 | 0.566 | 0.477 | 0.415 |
| 4.153185488045588 | 0.567 | 0.478 | 0.416 |
| 4.156327080699177 | 0.568 | 0.479 | 0.417 |
| 4.159468673352766 | 0.569 | 0.479 | 0.417 |
| 4.162610266006356 | 0.571 | 0.48 | 0.418 |
| 4.165751858659946 | 0.572 | 0.481 | 0.419 |
| 4.168893451313535 | 0.573 | 0.482 | 0.42 |
| 4.172035043967125 | 0.574 | 0.483 | 0.42 |
| 4.175176636620715 | 0.575 | 0.484 | 0.421 |
| 4.178318229274304 | 0.576 | 0.485 | 0.422 |
| 4.181459821927894 | 0.578 | 0.486 | 0.422 |
| 4.184601414581484 | 0.579 | 0.486 | 0.423 |
| 4.187743007235073 | 0.58 | 0.487 | 0.424 |
| 4.190884599888663 | 0.581 | 0.488 | 0.424 |
| 4.194026192542252 | 0.582 | 0.489 | 0.425 |
| 4.197167785195842 | 0.583 | 0.49 | 0.426 |
| 4.200309377849432 | 0.584 | 0.491 | 0.427 |
| 4.203450970503021 | 0.586 | 0.492 | 0.427 |
| 4.206592563156611 | 0.587 | 0.493 | 0.428 |
| 4.2097341558102 | 0.588 | 0.493 | 0.429 |
| 4.21287574846379 | 0.589 | 0.494 | 0.429 |
| 4.21601734111738 | 0.59 | 0.495 | 0.43 |
| 4.21915893377097 | 0.591 | 0.496 | 0.431 |
| 4.222300526424559 | 0.592 | 0.497 | 0.431 |
| 4.225442119078148 | 0.594 | 0.498 | 0.432 |
| 4.228583711731738 | 0.595 | 0.499 | 0.433 |
| 4.231725304385327 | 0.596 | 0.499 | 0.434 |
| 4.234866897038917 | 0.597 | 0.5 | 0.434 |
| 4.238008489692506 | 0.598 | 0.501 | 0.435 |
| 4.241150082346096 | 0.599 | 0.502 | 0.436 |
| 4.244291674999685 | 0.6 | 0.503 | 0.436 |
| 4.247433267653276 | 0.602 | 0.504 | 0.437 |
| 4.250574860306865 | 0.603 | 0.505 | 0.438 |
| 4.253716452960455 | 0.604 | 0.505 | 0.438 |
| 4.256858045614044 | 0.605 | 0.506 | 0.439 |
| 4.259999638267634 | 0.606 | 0.507 | 0.44 |
| 4.263141230921224 | 0.607 | 0.508 | 0.44 |
| 4.266282823574813 | 0.608 | 0.509 | 0.441 |
| 4.269424416228403 | 0.609 | 0.51 | 0.442 |
| 4.272566008881992 | 0.61 | 0.511 | 0.442 |
| 4.275707601535582 | 0.612 | 0.511 | 0.443 |
| 4.27884919418917 | 0.613 | 0.512 | 0.444 |
| 4.28199078684276 | 0.614 | 0.513 | 0.444 |
| 4.285132379496351 | 0.615 | 0.514 | 0.445 |
| 4.28827397214994 | 0.616 | 0.515 | 0.446 |
| 4.29141556480353 | 0.617 | 0.516 | 0.447 |
| 4.294557157457119 | 0.618 | 0.516 | 0.447 |
| 4.29769875011071 | 0.619 | 0.517 | 0.448 |
| 4.300840342764299 | 0.621 | 0.518 | 0.449 |
| 4.303981935417888 | 0.622 | 0.519 | 0.449 |
| 4.307123528071478 | 0.623 | 0.52 | 0.45 |
| 4.310265120725067 | 0.624 | 0.521 | 0.451 |
| 4.313406713378657 | 0.625 | 0.521 | 0.451 |
| 4.316548306032247 | 0.626 | 0.522 | 0.452 |
| 4.319689898685836 | 0.627 | 0.523 | 0.453 |
| 4.322831491339426 | 0.628 | 0.524 | 0.453 |
| 4.325973083993015 | 0.629 | 0.525 | 0.454 |
| 4.329114676646605 | 0.63 | 0.526 | 0.455 |
| 4.332256269300195 | 0.632 | 0.526 | 0.455 |
| 4.335397861953784 | 0.633 | 0.527 | 0.456 |
| 4.338539454607374 | 0.634 | 0.528 | 0.457 |
| 4.341681047260963 | 0.635 | 0.529 | 0.457 |
| 4.344822639914553 | 0.636 | 0.53 | 0.458 |
| 4.347964232568143 | 0.637 | 0.531 | 0.459 |
| 4.351105825221732 | 0.638 | 0.531 | 0.459 |
| 4.354247417875322 | 0.639 | 0.532 | 0.46 |
| 4.357389010528911 | 0.64 | 0.533 | 0.461 |
| 4.360530603182501 | 0.641 | 0.534 | 0.461 |
| 4.36367219583609 | 0.643 | 0.535 | 0.462 |
| 4.36681378848968 | 0.644 | 0.536 | 0.463 |
| 4.36995538114327 | 0.645 | 0.536 | 0.463 |
| 4.373096973796859 | 0.646 | 0.537 | 0.464 |
| 4.376238566450449 | 0.647 | 0.538 | 0.465 |
| 4.379380159104038 | 0.648 | 0.539 | 0.465 |
| 4.382521751757628 | 0.649 | 0.54 | 0.466 |
| 4.385663344411217 | 0.65 | 0.54 | 0.466 |
| 4.388804937064807 | 0.651 | 0.541 | 0.467 |
| 4.391946529718397 | 0.652 | 0.542 | 0.468 |
| 4.395088122371987 | 0.653 | 0.543 | 0.468 |
| 4.398229715025576 | 0.654 | 0.544 | 0.469 |
| 4.401371307679165 | 0.656 | 0.545 | 0.47 |
| 4.404512900332755 | 0.657 | 0.545 | 0.47 |
| 4.407654492986345 | 0.658 | 0.546 | 0.471 |
| 4.410796085639934 | 0.659 | 0.547 | 0.472 |
| 4.413937678293524 | 0.66 | 0.548 | 0.472 |
| 4.417079270947114 | 0.661 | 0.549 | 0.473 |
| 4.420220863600703 | 0.662 | 0.549 | 0.474 |
| 4.423362456254293 | 0.663 | 0.55 | 0.474 |
| 4.426504048907883 | 0.664 | 0.551 | 0.475 |
| 4.429645641561472 | 0.665 | 0.552 | 0.476 |
| 4.432787234215062 | 0.666 | 0.553 | 0.476 |
| 4.435928826868651 | 0.667 | 0.553 | 0.477 |
| 4.43907041952224 | 0.668 | 0.554 | 0.478 |
| 4.44221201217583 | 0.67 | 0.555 | 0.478 |
| 4.44535360482942 | 0.671 | 0.556 | 0.479 |
| 4.44849519748301 | 0.672 | 0.557 | 0.48 |
| 4.4516367901366 | 0.673 | 0.557 | 0.48 |
| 4.454778382790188 | 0.674 | 0.558 | 0.481 |
| 4.457919975443779 | 0.675 | 0.559 | 0.481 |
| 4.461061568097368 | 0.676 | 0.56 | 0.482 |
| 4.464203160750958 | 0.677 | 0.561 | 0.483 |
| 4.467344753404547 | 0.678 | 0.561 | 0.483 |
| 4.470486346058137 | 0.679 | 0.562 | 0.484 |
| 4.473627938711726 | 0.68 | 0.563 | 0.485 |
| 4.476769531365316 | 0.681 | 0.564 | 0.485 |
| 4.479911124018905 | 0.682 | 0.565 | 0.486 |
| 4.483052716672495 | 0.683 | 0.566 | 0.487 |
| 4.486194309326085 | 0.685 | 0.566 | 0.487 |
| 4.489335901979674 | 0.686 | 0.567 | 0.488 |
| 4.492477494633264 | 0.687 | 0.568 | 0.489 |
| 4.495619087286854 | 0.688 | 0.569 | 0.489 |
| 4.498760679940443 | 0.689 | 0.57 | 0.49 |
| 4.501902272594033 | 0.69 | 0.57 | 0.49 |
| 4.505043865247622 | 0.691 | 0.571 | 0.491 |
| 4.508185457901212 | 0.692 | 0.572 | 0.492 |
| 4.511327050554801 | 0.693 | 0.573 | 0.492 |
| 4.514468643208391 | 0.694 | 0.574 | 0.493 |
| 4.517610235861981 | 0.695 | 0.574 | 0.494 |
| 4.520751828515571 | 0.696 | 0.575 | 0.494 |
| 4.52389342116916 | 0.697 | 0.576 | 0.495 |
| 4.52703501382275 | 0.698 | 0.577 | 0.496 |
| 4.530176606476339 | 0.699 | 0.577 | 0.496 |
| 4.533318199129928 | 0.7 | 0.578 | 0.497 |
| 4.536459791783518 | 0.702 | 0.579 | 0.497 |
| 4.539601384437108 | 0.703 | 0.58 | 0.498 |
| 4.542742977090698 | 0.704 | 0.581 | 0.499 |
| 4.545884569744287 | 0.705 | 0.581 | 0.499 |
| 4.549026162397876 | 0.706 | 0.582 | 0.5 |
| 4.552167755051466 | 0.707 | 0.583 | 0.501 |
| 4.555309347705056 | 0.708 | 0.584 | 0.501 |
| 4.558450940358646 | 0.709 | 0.585 | 0.502 |
| 4.561592533012235 | 0.71 | 0.585 | 0.503 |
| 4.564734125665825 | 0.711 | 0.586 | 0.503 |
| 4.567875718319415 | 0.712 | 0.587 | 0.504 |
| 4.571017310973004 | 0.713 | 0.588 | 0.504 |
| 4.574158903626594 | 0.714 | 0.589 | 0.505 |
| 4.577300496280183 | 0.715 | 0.589 | 0.506 |
| 4.580442088933772 | 0.716 | 0.59 | 0.506 |
| 4.583583681587362 | 0.717 | 0.591 | 0.507 |
| 4.586725274240952 | 0.718 | 0.592 | 0.508 |
| 4.589866866894542 | 0.719 | 0.593 | 0.508 |
| 4.593008459548131 | 0.72 | 0.593 | 0.509 |
| 4.596150052201721 | 0.722 | 0.594 | 0.509 |
| 4.59929164485531 | 0.723 | 0.595 | 0.51 |
| 4.6024332375089 | 0.724 | 0.596 | 0.511 |
| 4.60557483016249 | 0.725 | 0.596 | 0.511 |
| 4.608716422816079 | 0.726 | 0.597 | 0.512 |
| 4.611858015469668 | 0.727 | 0.598 | 0.513 |
| 4.614999608123258 | 0.728 | 0.599 | 0.513 |
| 4.618141200776848 | 0.729 | 0.6 | 0.514 |
| 4.621282793430437 | 0.73 | 0.6 | 0.515 |
| 4.624424386084027 | 0.731 | 0.601 | 0.515 |
| 4.627565978737617 | 0.732 | 0.602 | 0.516 |
| 4.630707571391206 | 0.733 | 0.603 | 0.516 |
| 4.633849164044795 | 0.734 | 0.604 | 0.517 |
| 4.636990756698386 | 0.735 | 0.604 | 0.518 |
| 4.640132349351975 | 0.736 | 0.605 | 0.518 |
| 4.643273942005564 | 0.737 | 0.606 | 0.519 |
| 4.646415534659154 | 0.738 | 0.607 | 0.52 |
| 4.649557127312744 | 0.739 | 0.608 | 0.52 |
| 4.652698719966334 | 0.74 | 0.608 | 0.521 |
| 4.655840312619923 | 0.741 | 0.609 | 0.521 |
| 4.658981905273513 | 0.743 | 0.61 | 0.522 |
| 4.662123497927102 | 0.744 | 0.611 | 0.523 |
| 4.665265090580692 | 0.745 | 0.611 | 0.523 |
| 4.668406683234282 | 0.746 | 0.612 | 0.524 |
| 4.671548275887871 | 0.747 | 0.613 | 0.525 |
| 4.674689868541461 | 0.748 | 0.614 | 0.525 |
| 4.67783146119505 | 0.749 | 0.615 | 0.526 |
| 4.68097305384864 | 0.75 | 0.615 | 0.526 |
| 4.68411464650223 | 0.751 | 0.616 | 0.527 |
| 4.687256239155819 | 0.752 | 0.617 | 0.528 |
| 4.690397831809409 | 0.753 | 0.618 | 0.528 |
| 4.693539424462998 | 0.754 | 0.619 | 0.529 |
| 4.696681017116588 | 0.755 | 0.619 | 0.53 |
| 4.699822609770177 | 0.756 | 0.62 | 0.53 |
| 4.702964202423767 | 0.757 | 0.621 | 0.531 |
| 4.706105795077356 | 0.758 | 0.622 | 0.532 |
| 4.709247387730946 | 0.759 | 0.622 | 0.532 |
| 4.712388980384535 | 0.76 | 0.623 | 0.533 |
| 4.715530573038126 | 0.761 | 0.624 | 0.533 |
| 4.718672165691715 | 0.762 | 0.625 | 0.534 |
| 4.721813758345305 | 0.763 | 0.626 | 0.535 |
| 4.724955350998894 | 0.765 | 0.626 | 0.535 |
| 4.728096943652484 | 0.766 | 0.627 | 0.536 |
| 4.731238536306074 | 0.767 | 0.628 | 0.537 |
| 4.734380128959663 | 0.768 | 0.629 | 0.537 |
| 4.737521721613253 | 0.769 | 0.63 | 0.538 |
| 4.740663314266842 | 0.77 | 0.63 | 0.538 |
| 4.743804906920432 | 0.771 | 0.631 | 0.539 |
| 4.74694649957402 | 0.772 | 0.632 | 0.54 |
| 4.750088092227611 | 0.773 | 0.633 | 0.54 |
| 4.7532296848812 | 0.774 | 0.633 | 0.541 |
| 4.75637127753479 | 0.775 | 0.634 | 0.542 |
| 4.75951287018838 | 0.776 | 0.635 | 0.542 |
| 4.76265446284197 | 0.777 | 0.636 | 0.543 |
| 4.765796055495559 | 0.778 | 0.637 | 0.543 |
| 4.768937648149149 | 0.779 | 0.637 | 0.544 |
| 4.772079240802738 | 0.78 | 0.638 | 0.545 |
| 4.775220833456327 | 0.781 | 0.639 | 0.545 |
| 4.778362426109917 | 0.782 | 0.64 | 0.546 |
| 4.781504018763507 | 0.783 | 0.641 | 0.547 |
| 4.784645611417097 | 0.784 | 0.641 | 0.547 |
| 4.787787204070686 | 0.785 | 0.642 | 0.548 |
| 4.790928796724275 | 0.787 | 0.643 | 0.548 |
| 4.794070389377865 | 0.788 | 0.644 | 0.549 |
| 4.797211982031455 | 0.789 | 0.644 | 0.55 |
| 4.800353574685045 | 0.79 | 0.645 | 0.55 |
| 4.803495167338634 | 0.791 | 0.646 | 0.551 |
| 4.806636759992224 | 0.792 | 0.647 | 0.552 |
| 4.809778352645814 | 0.793 | 0.648 | 0.552 |
| 4.812919945299403 | 0.794 | 0.648 | 0.553 |
| 4.816061537952993 | 0.795 | 0.649 | 0.554 |
| 4.819203130606582 | 0.796 | 0.65 | 0.554 |
| 4.822344723260172 | 0.797 | 0.651 | 0.555 |
| 4.825486315913761 | 0.798 | 0.652 | 0.555 |
| 4.828627908567351 | 0.799 | 0.652 | 0.556 |
| 4.83176950122094 | 0.8 | 0.653 | 0.557 |
| 4.83491109387453 | 0.801 | 0.654 | 0.557 |
| 4.83805268652812 | 0.802 | 0.655 | 0.558 |
| 4.841194279181709 | 0.803 | 0.655 | 0.559 |
| 4.844335871835299 | 0.804 | 0.656 | 0.559 |
| 4.847477464488889 | 0.805 | 0.657 | 0.56 |
| 4.850619057142478 | 0.807 | 0.658 | 0.56 |
| 4.853760649796068 | 0.808 | 0.659 | 0.561 |
| 4.856902242449657 | 0.809 | 0.659 | 0.562 |
| 4.860043835103247 | 0.81 | 0.66 | 0.562 |
| 4.863185427756837 | 0.811 | 0.661 | 0.563 |
| 4.866327020410426 | 0.812 | 0.662 | 0.564 |
| 4.869468613064015 | 0.813 | 0.663 | 0.564 |
| 4.872610205717605 | 0.814 | 0.663 | 0.565 |
| 4.875751798371195 | 0.815 | 0.664 | 0.566 |
| 4.878893391024784 | 0.816 | 0.665 | 0.566 |
| 4.882034983678374 | 0.817 | 0.666 | 0.567 |
| 4.885176576331964 | 0.818 | 0.667 | 0.567 |
| 4.888318168985553 | 0.819 | 0.667 | 0.568 |
| 4.891459761639143 | 0.82 | 0.668 | 0.569 |
| 4.894601354292733 | 0.821 | 0.669 | 0.569 |
| 4.897742946946322 | 0.822 | 0.67 | 0.57 |
| 4.900884539599912 | 0.823 | 0.671 | 0.571 |
| 4.904026132253501 | 0.824 | 0.671 | 0.571 |
| 4.907167724907091 | 0.826 | 0.672 | 0.572 |
| 4.91030931756068 | 0.827 | 0.673 | 0.573 |
| 4.91345091021427 | 0.828 | 0.674 | 0.573 |
| 4.91659250286786 | 0.829 | 0.675 | 0.574 |
| 4.91973409552145 | 0.83 | 0.675 | 0.574 |
| 4.922875688175039 | 0.831 | 0.676 | 0.575 |
| 4.926017280828628 | 0.832 | 0.677 | 0.576 |
| 4.929158873482218 | 0.833 | 0.678 | 0.576 |
| 4.932300466135808 | 0.834 | 0.679 | 0.577 |
| 4.935442058789397 | 0.835 | 0.679 | 0.578 |
| 4.938583651442987 | 0.836 | 0.68 | 0.578 |
| 4.941725244096576 | 0.837 | 0.681 | 0.579 |
| 4.944866836750166 | 0.838 | 0.682 | 0.58 |
| 4.948008429403755 | 0.839 | 0.683 | 0.58 |
| 4.951150022057345 | 0.84 | 0.683 | 0.581 |
| 4.954291614710935 | 0.842 | 0.684 | 0.582 |
| 4.957433207364524 | 0.843 | 0.685 | 0.582 |
| 4.960574800018114 | 0.844 | 0.686 | 0.583 |
| 4.963716392671704 | 0.845 | 0.687 | 0.583 |
| 4.966857985325293 | 0.846 | 0.687 | 0.584 |
| 4.969999577978883 | 0.847 | 0.688 | 0.585 |
| 4.973141170632472 | 0.848 | 0.689 | 0.585 |
| 4.976282763286062 | 0.849 | 0.69 | 0.586 |
| 4.979424355939651 | 0.85 | 0.691 | 0.587 |
| 4.982565948593241 | 0.851 | 0.691 | 0.587 |
| 4.985707541246831 | 0.852 | 0.692 | 0.588 |
| 4.98884913390042 | 0.853 | 0.693 | 0.589 |
| 4.99199072655401 | 0.854 | 0.694 | 0.589 |
| 4.9951323192076 | 0.855 | 0.695 | 0.59 |
| 4.99827391186119 | 0.857 | 0.695 | 0.591 |
| 5.00141550451478 | 0.858 | 0.696 | 0.591 |
| 5.004557097168369 | 0.859 | 0.697 | 0.592 |
| 5.007698689821958 | 0.86 | 0.698 | 0.593 |
| 5.010840282475548 | 0.861 | 0.699 | 0.593 |
| 5.013981875129137 | 0.862 | 0.699 | 0.594 |
| 5.017123467782727 | 0.863 | 0.7 | 0.594 |
| 5.020265060436317 | 0.864 | 0.701 | 0.595 |
| 5.023406653089906 | 0.865 | 0.702 | 0.596 |
| 5.026548245743496 | 0.866 | 0.703 | 0.596 |
| 5.029689838397085 | 0.867 | 0.704 | 0.597 |
| 5.032831431050674 | 0.868 | 0.704 | 0.598 |
| 5.035973023704264 | 0.869 | 0.705 | 0.598 |
| 5.039114616357854 | 0.871 | 0.706 | 0.599 |
| 5.042256209011444 | 0.872 | 0.707 | 0.6 |
| 5.045397801665033 | 0.873 | 0.708 | 0.6 |
| 5.048539394318622 | 0.874 | 0.708 | 0.601 |
| 5.051680986972213 | 0.875 | 0.709 | 0.602 |
| 5.054822579625802 | 0.876 | 0.71 | 0.602 |
| 5.057964172279392 | 0.877 | 0.711 | 0.603 |
| 5.061105764932981 | 0.878 | 0.712 | 0.604 |
| 5.064247357586571 | 0.879 | 0.713 | 0.604 |
| 5.067388950240161 | 0.88 | 0.713 | 0.605 |
| 5.07053054289375 | 0.881 | 0.714 | 0.606 |
| 5.07367213554734 | 0.883 | 0.715 | 0.606 |
| 5.07681372820093 | 0.884 | 0.716 | 0.607 |
| 5.079955320854519 | 0.885 | 0.717 | 0.608 |
| 5.083096913508108 | 0.886 | 0.718 | 0.608 |
| 5.086238506161698 | 0.887 | 0.718 | 0.609 |
| 5.089380098815288 | 0.888 | 0.719 | 0.61 |
| 5.092521691468877 | 0.889 | 0.72 | 0.61 |
| 5.095663284122466 | 0.89 | 0.721 | 0.611 |
| 5.098804876776057 | 0.891 | 0.722 | 0.612 |
| 5.101946469429646 | 0.892 | 0.723 | 0.612 |
| 5.105088062083236 | 0.894 | 0.723 | 0.613 |
| 5.108229654736825 | 0.895 | 0.724 | 0.614 |
| 5.111371247390415 | 0.896 | 0.725 | 0.614 |
| 5.114512840044005 | 0.897 | 0.726 | 0.615 |
| 5.117654432697594 | 0.898 | 0.727 | 0.616 |
| 5.120796025351184 | 0.899 | 0.728 | 0.616 |
| 5.123937618004773 | 0.9 | 0.728 | 0.617 |
| 5.127079210658363 | 0.901 | 0.729 | 0.618 |
| 5.130220803311953 | 0.902 | 0.73 | 0.618 |
| 5.133362395965542 | 0.904 | 0.731 | 0.619 |
| 5.136503988619131 | 0.905 | 0.732 | 0.62 |
| 5.13964558127272 | 0.906 | 0.733 | 0.62 |
| 5.142787173926311 | 0.907 | 0.733 | 0.621 |
| 5.1459287665799 | 0.908 | 0.734 | 0.622 |
| 5.14907035923349 | 0.909 | 0.735 | 0.622 |
| 5.15221195188708 | 0.91 | 0.736 | 0.623 |
| 5.15535354454067 | 0.911 | 0.737 | 0.624 |
| 5.158495137194259 | 0.912 | 0.738 | 0.624 |
| 5.161636729847848 | 0.914 | 0.738 | 0.625 |
| 5.164778322501438 | 0.915 | 0.739 | 0.626 |
| 5.167919915155028 | 0.916 | 0.74 | 0.627 |
| 5.171061507808617 | 0.917 | 0.741 | 0.627 |
| 5.174203100462206 | 0.918 | 0.742 | 0.628 |
| 5.177344693115796 | 0.919 | 0.743 | 0.629 |
| 5.180486285769386 | 0.92 | 0.744 | 0.629 |
| 5.183627878422976 | 0.921 | 0.744 | 0.63 |
| 5.186769471076565 | 0.923 | 0.745 | 0.631 |
| 5.189911063730155 | 0.924 | 0.746 | 0.631 |
| 5.193052656383744 | 0.925 | 0.747 | 0.632 |
| 5.196194249037334 | 0.926 | 0.748 | 0.633 |
| 5.199335841690924 | 0.927 | 0.749 | 0.633 |
| 5.202477434344513 | 0.928 | 0.75 | 0.634 |
| 5.205619026998103 | 0.929 | 0.75 | 0.635 |
| 5.208760619651692 | 0.931 | 0.751 | 0.635 |
| 5.211902212305282 | 0.932 | 0.752 | 0.636 |
| 5.215043804958871 | 0.933 | 0.753 | 0.637 |
| 5.218185397612461 | 0.934 | 0.754 | 0.638 |
| 5.221326990266051 | 0.935 | 0.755 | 0.638 |
| 5.22446858291964 | 0.936 | 0.756 | 0.639 |
| 5.22761017557323 | 0.937 | 0.757 | 0.64 |
| 5.23075176822682 | 0.939 | 0.757 | 0.64 |
| 5.23389336088041 | 0.94 | 0.758 | 0.641 |
| 5.237034953533999 | 0.941 | 0.759 | 0.642 |
| 5.240176546187588 | 0.942 | 0.76 | 0.642 |
| 5.243318138841178 | 0.943 | 0.761 | 0.643 |
| 5.246459731494767 | 0.944 | 0.762 | 0.644 |
| 5.249601324148357 | 0.945 | 0.763 | 0.645 |
| 5.252742916801947 | 0.947 | 0.764 | 0.645 |
| 5.255884509455536 | 0.948 | 0.764 | 0.646 |
| 5.259026102109125 | 0.949 | 0.765 | 0.647 |
| 5.262167694762715 | 0.95 | 0.766 | 0.647 |
| 5.265309287416305 | 0.951 | 0.767 | 0.648 |
| 5.268450880069895 | 0.952 | 0.768 | 0.649 |
| 5.271592472723484 | 0.954 | 0.769 | 0.65 |
| 5.274734065377074 | 0.955 | 0.77 | 0.65 |
| 5.277875658030664 | 0.956 | 0.771 | 0.651 |
| 5.281017250684253 | 0.957 | 0.771 | 0.652 |
| 5.284158843337843 | 0.958 | 0.772 | 0.652 |
| 5.287300435991432 | 0.959 | 0.773 | 0.653 |
| 5.290442028645022 | 0.961 | 0.774 | 0.654 |
| 5.293583621298612 | 0.962 | 0.775 | 0.655 |
| 5.296725213952201 | 0.963 | 0.776 | 0.655 |
| 5.299866806605791 | 0.964 | 0.777 | 0.656 |
| 5.30300839925938 | 0.965 | 0.778 | 0.657 |
| 5.30614999191297 | 0.966 | 0.779 | 0.658 |
| 5.30929158456656 | 0.968 | 0.78 | 0.658 |
| 5.312433177220149 | 0.969 | 0.78 | 0.659 |
| 5.315574769873739 | 0.97 | 0.781 | 0.66 |
| 5.318716362527328 | 0.971 | 0.782 | 0.66 |
| 5.321857955180918 | 0.972 | 0.783 | 0.661 |
| 5.324999547834508 | 0.974 | 0.784 | 0.662 |
| 5.328141140488097 | 0.975 | 0.785 | 0.663 |
| 5.331282733141686 | 0.976 | 0.786 | 0.663 |
| 5.334424325795276 | 0.977 | 0.787 | 0.664 |
| 5.337565918448866 | 0.978 | 0.788 | 0.665 |
| 5.340707511102456 | 0.98 | 0.789 | 0.666 |
| 5.343849103756045 | 0.981 | 0.79 | 0.666 |
| 5.346990696409634 | 0.982 | 0.79 | 0.667 |
| 5.350132289063224 | 0.983 | 0.791 | 0.668 |
| 5.353273881716814 | 0.984 | 0.792 | 0.669 |
| 5.356415474370403 | 0.986 | 0.793 | 0.669 |
| 5.359557067023993 | 0.987 | 0.794 | 0.67 |
| 5.362698659677583 | 0.988 | 0.795 | 0.671 |
| 5.365840252331172 | 0.989 | 0.796 | 0.672 |
| 5.368981844984762 | 0.99 | 0.797 | 0.672 |
| 5.372123437638351 | 0.992 | 0.798 | 0.673 |
| 5.375265030291941 | 0.993 | 0.799 | 0.674 |
| 5.378406622945531 | 0.994 | 0.8 | 0.675 |
| 5.38154821559912 | 0.995 | 0.801 | 0.675 |
| 5.38468980825271 | 0.997 | 0.802 | 0.676 |
| 5.387831400906299 | 0.998 | 0.803 | 0.677 |
| 5.39097299355989 | 0.999 | 0.804 | 0.678 |
| 5.394114586213479 | 1 | 0.804 | 0.678 |
| 5.397256178867068 | 1.001 | 0.805 | 0.679 |
| 5.400397771520657 | 1.003 | 0.806 | 0.68 |
| 5.403539364174247 | 1.004 | 0.807 | 0.681 |
| 5.406680956827837 | 1.005 | 0.808 | 0.681 |
| 5.409822549481426 | 1.006 | 0.809 | 0.682 |
| 5.412964142135016 | 1.008 | 0.81 | 0.683 |
| 5.416105734788605 | 1.009 | 0.811 | 0.684 |
| 5.419247327442195 | 1.01 | 0.812 | 0.685 |
| 5.422388920095785 | 1.011 | 0.813 | 0.685 |
| 5.425530512749375 | 1.013 | 0.814 | 0.686 |
| 5.428672105402964 | 1.014 | 0.815 | 0.687 |
| 5.431813698056554 | 1.015 | 0.816 | 0.688 |
| 5.434955290710143 | 1.016 | 0.817 | 0.688 |
| 5.438096883363733 | 1.018 | 0.818 | 0.689 |
| 5.441238476017322 | 1.019 | 0.819 | 0.69 |
| 5.444380068670912 | 1.02 | 0.82 | 0.691 |
| 5.447521661324502 | 1.021 | 0.821 | 0.692 |
| 5.450663253978091 | 1.023 | 0.822 | 0.692 |
| 5.453804846631681 | 1.024 | 0.823 | 0.693 |
| 5.456946439285271 | 1.025 | 0.824 | 0.694 |
| 5.46008803193886 | 1.026 | 0.825 | 0.695 |
| 5.46322962459245 | 1.028 | 0.826 | 0.696 |
| 5.466371217246039 | 1.029 | 0.827 | 0.696 |
| 5.46951280989963 | 1.03 | 0.828 | 0.697 |
| 5.472654402553218 | 1.032 | 0.829 | 0.698 |
| 5.475795995206808 | 1.033 | 0.83 | 0.699 |
| 5.478937587860398 | 1.034 | 0.831 | 0.7 |
| 5.482079180513987 | 1.035 | 0.832 | 0.7 |
| 5.485220773167577 | 1.037 | 0.833 | 0.701 |
| 5.488362365821166 | 1.038 | 0.834 | 0.702 |
| 5.491503958474756 | 1.039 | 0.835 | 0.703 |
| 5.494645551128346 | 1.041 | 0.836 | 0.704 |
| 5.497787143781935 | 1.042 | 0.837 | 0.705 |
| 5.500928736435525 | 1.043 | 0.838 | 0.705 |
| 5.504070329089115 | 1.045 | 0.839 | 0.706 |
| 5.507211921742704 | 1.046 | 0.84 | 0.707 |
| 5.510353514396294 | 1.047 | 0.841 | 0.708 |
| 5.513495107049883 | 1.048 | 0.842 | 0.709 |
| 5.516636699703473 | 1.05 | 0.843 | 0.709 |
| 5.519778292357062 | 1.051 | 0.844 | 0.71 |
| 5.522919885010652 | 1.052 | 0.845 | 0.711 |
| 5.526061477664242 | 1.054 | 0.846 | 0.712 |
| 5.529203070317831 | 1.055 | 0.847 | 0.713 |
| 5.532344662971421 | 1.056 | 0.848 | 0.714 |
| 5.535486255625011 | 1.058 | 0.849 | 0.715 |
| 5.5386278482786 | 1.059 | 0.85 | 0.715 |
| 5.54176944093219 | 1.06 | 0.851 | 0.716 |
| 5.544911033585779 | 1.062 | 0.852 | 0.717 |
| 5.54805262623937 | 1.063 | 0.853 | 0.718 |
| 5.551194218892959 | 1.064 | 0.854 | 0.719 |
| 5.554335811546548 | 1.066 | 0.855 | 0.72 |
| 5.557477404200137 | 1.067 | 0.856 | 0.72 |
| 5.560618996853727 | 1.068 | 0.857 | 0.721 |
| 5.563760589507317 | 1.07 | 0.858 | 0.722 |
| 5.566902182160906 | 1.071 | 0.859 | 0.723 |
| 5.570043774814496 | 1.073 | 0.86 | 0.724 |
| 5.573185367468086 | 1.074 | 0.861 | 0.725 |
| 5.576326960121675 | 1.075 | 0.862 | 0.726 |
| 5.579468552775264 | 1.077 | 0.864 | 0.727 |
| 5.582610145428854 | 1.078 | 0.865 | 0.727 |
| 5.585751738082444 | 1.079 | 0.866 | 0.728 |
| 5.588893330736034 | 1.081 | 0.867 | 0.729 |
| 5.592034923389623 | 1.082 | 0.868 | 0.73 |
| 5.595176516043213 | 1.084 | 0.869 | 0.731 |
| 5.598318108696803 | 1.085 | 0.87 | 0.732 |
| 5.601459701350392 | 1.086 | 0.871 | 0.733 |
| 5.604601294003982 | 1.088 | 0.872 | 0.734 |
| 5.607742886657571 | 1.089 | 0.873 | 0.735 |
| 5.610884479311161 | 1.09 | 0.874 | 0.735 |
| 5.61402607196475 | 1.092 | 0.875 | 0.736 |
| 5.61716766461834 | 1.093 | 0.877 | 0.737 |
| 5.62030925727193 | 1.095 | 0.878 | 0.738 |
| 5.623450849925519 | 1.096 | 0.879 | 0.739 |
| 5.626592442579109 | 1.098 | 0.88 | 0.74 |
| 5.629734035232698 | 1.099 | 0.881 | 0.741 |
| 5.632875627886288 | 1.1 | 0.882 | 0.742 |
| 5.636017220539878 | 1.102 | 0.883 | 0.743 |
| 5.639158813193467 | 1.103 | 0.884 | 0.744 |
| 5.642300405847057 | 1.105 | 0.885 | 0.745 |
| 5.645441998500646 | 1.106 | 0.887 | 0.745 |
| 5.648583591154236 | 1.107 | 0.888 | 0.746 |
| 5.651725183807825 | 1.109 | 0.889 | 0.747 |
| 5.654866776461415 | 1.11 | 0.89 | 0.748 |
| 5.658008369115005 | 1.112 | 0.891 | 0.749 |
| 5.661149961768594 | 1.113 | 0.892 | 0.75 |
| 5.664291554422184 | 1.115 | 0.893 | 0.751 |
| 5.667433147075774 | 1.116 | 0.895 | 0.752 |
| 5.670574739729363 | 1.118 | 0.896 | 0.753 |
| 5.673716332382953 | 1.119 | 0.897 | 0.754 |
| 5.676857925036542 | 1.121 | 0.898 | 0.755 |
| 5.679999517690132 | 1.122 | 0.899 | 0.756 |
| 5.683141110343721 | 1.124 | 0.9 | 0.757 |
| 5.686282702997311 | 1.125 | 0.901 | 0.758 |
| 5.689424295650901 | 1.126 | 0.903 | 0.759 |
| 5.69256588830449 | 1.128 | 0.904 | 0.76 |
| 5.69570748095808 | 1.129 | 0.905 | 0.761 |
| 5.69884907361167 | 1.131 | 0.906 | 0.762 |
| 5.701990666265259 | 1.132 | 0.907 | 0.763 |
| 5.705132258918849 | 1.134 | 0.909 | 0.764 |
| 5.708273851572438 | 1.135 | 0.91 | 0.765 |
| 5.711415444226028 | 1.137 | 0.911 | 0.766 |
| 5.714557036879618 | 1.138 | 0.912 | 0.767 |
| 5.717698629533207 | 1.14 | 0.913 | 0.768 |
| 5.720840222186797 | 1.141 | 0.915 | 0.769 |
| 5.723981814840386 | 1.143 | 0.916 | 0.77 |
| 5.727123407493976 | 1.145 | 0.917 | 0.771 |
| 5.730265000147565 | 1.146 | 0.918 | 0.772 |
| 5.733406592801155 | 1.148 | 0.919 | 0.773 |
| 5.736548185454744 | 1.149 | 0.921 | 0.774 |
| 5.739689778108334 | 1.151 | 0.922 | 0.775 |
| 5.742831370761924 | 1.152 | 0.923 | 0.776 |
| 5.745972963415514 | 1.154 | 0.924 | 0.777 |
| 5.749114556069103 | 1.155 | 0.926 | 0.778 |
| 5.752256148722693 | 1.157 | 0.927 | 0.779 |
| 5.755397741376282 | 1.158 | 0.928 | 0.78 |
| 5.758539334029872 | 1.16 | 0.929 | 0.781 |
| 5.761680926683462 | 1.162 | 0.931 | 0.782 |
| 5.764822519337051 | 1.163 | 0.932 | 0.783 |
| 5.767964111990641 | 1.165 | 0.933 | 0.784 |
| 5.77110570464423 | 1.166 | 0.934 | 0.785 |
| 5.77424729729782 | 1.168 | 0.936 | 0.786 |
| 5.77738888995141 | 1.17 | 0.937 | 0.787 |
| 5.780530482605 | 1.171 | 0.938 | 0.788 |
| 5.783672075258588 | 1.173 | 0.94 | 0.789 |
| 5.786813667912178 | 1.174 | 0.941 | 0.79 |
| 5.789955260565768 | 1.176 | 0.942 | 0.792 |
| 5.793096853219358 | 1.178 | 0.943 | 0.793 |
| 5.796238445872947 | 1.179 | 0.945 | 0.794 |
| 5.799380038526537 | 1.181 | 0.946 | 0.795 |
| 5.802521631180126 | 1.182 | 0.947 | 0.796 |
| 5.805663223833715 | 1.184 | 0.949 | 0.797 |
| 5.808804816487306 | 1.186 | 0.95 | 0.798 |
| 5.811946409140895 | 1.187 | 0.951 | 0.799 |
| 5.815088001794485 | 1.189 | 0.953 | 0.8 |
| 5.818229594448074 | 1.191 | 0.954 | 0.802 |
| 5.821371187101663 | 1.192 | 0.955 | 0.803 |
| 5.824512779755254 | 1.194 | 0.957 | 0.804 |
| 5.827654372408843 | 1.196 | 0.958 | 0.805 |
| 5.830795965062433 | 1.197 | 0.959 | 0.806 |
| 5.833937557716022 | 1.199 | 0.961 | 0.807 |
| 5.837079150369612 | 1.201 | 0.962 | 0.808 |
| 5.840220743023201 | 1.202 | 0.963 | 0.81 |
| 5.843362335676791 | 1.204 | 0.965 | 0.811 |
| 5.846503928330381 | 1.206 | 0.966 | 0.812 |
| 5.84964552098397 | 1.207 | 0.968 | 0.813 |
| 5.85278711363756 | 1.209 | 0.969 | 0.814 |
| 5.85592870629115 | 1.211 | 0.97 | 0.815 |
| 5.85907029894474 | 1.213 | 0.972 | 0.817 |
| 5.862211891598329 | 1.214 | 0.973 | 0.818 |
| 5.865353484251918 | 1.216 | 0.975 | 0.819 |
| 5.868495076905508 | 1.218 | 0.976 | 0.82 |
| 5.871636669559098 | 1.22 | 0.977 | 0.821 |
| 5.874778262212687 | 1.221 | 0.979 | 0.823 |
| 5.877919854866277 | 1.223 | 0.98 | 0.824 |
| 5.881061447519866 | 1.225 | 0.982 | 0.825 |
| 5.884203040173456 | 1.227 | 0.983 | 0.826 |
| 5.887344632827046 | 1.228 | 0.985 | 0.827 |
| 5.890486225480635 | 1.23 | 0.986 | 0.829 |
| 5.893627818134224 | 1.232 | 0.988 | 0.83 |
| 5.896769410787814 | 1.234 | 0.989 | 0.831 |
| 5.899911003441404 | 1.235 | 0.991 | 0.832 |
| 5.903052596094994 | 1.237 | 0.992 | 0.834 |
| 5.906194188748583 | 1.239 | 0.994 | 0.835 |
| 5.909335781402172 | 1.241 | 0.995 | 0.836 |
| 5.912477374055762 | 1.243 | 0.997 | 0.838 |
| 5.915618966709352 | 1.245 | 0.998 | 0.839 |
| 5.918760559362942 | 1.246 | 1 | 0.84 |
| 5.921902152016531 | 1.248 | 1.001 | 0.841 |
| 5.92504374467012 | 1.25 | 1.003 | 0.843 |
| 5.92818533732371 | 1.252 | 1.004 | 0.844 |
| 5.9313269299773 | 1.254 | 1.006 | 0.845 |
| 5.93446852263089 | 1.256 | 1.007 | 0.847 |
| 5.93761011528448 | 1.257 | 1.009 | 0.848 |
| 5.940751707938068 | 1.259 | 1.01 | 0.849 |
| 5.943893300591658 | 1.261 | 1.012 | 0.851 |
| 5.947034893245248 | 1.263 | 1.013 | 0.852 |
| 5.950176485898837 | 1.265 | 1.015 | 0.853 |
| 5.953318078552427 | 1.267 | 1.017 | 0.855 |
| 5.956459671206017 | 1.269 | 1.018 | 0.856 |
| 5.959601263859606 | 1.271 | 1.02 | 0.857 |
| 5.962742856513196 | 1.273 | 1.021 | 0.859 |
| 5.965884449166785 | 1.275 | 1.023 | 0.86 |
| 5.969026041820375 | 1.277 | 1.025 | 0.862 |
| 5.972167634473964 | 1.278 | 1.026 | 0.863 |
| 5.975309227127554 | 1.28 | 1.028 | 0.864 |
| 5.978450819781144 | 1.282 | 1.03 | 0.866 |
| 5.981592412434733 | 1.284 | 1.031 | 0.867 |
| 5.984734005088323 | 1.286 | 1.033 | 0.869 |
| 5.987875597741913 | 1.288 | 1.035 | 0.87 |
| 5.991017190395502 | 1.29 | 1.036 | 0.872 |
| 5.994158783049092 | 1.292 | 1.038 | 0.873 |
| 5.997300375702681 | 1.294 | 1.04 | 0.875 |
| 6.000441968356271 | 1.296 | 1.041 | 0.876 |
| 6.003583561009861 | 1.298 | 1.043 | 0.878 |
| 6.00672515366345 | 1.3 | 1.045 | 0.879 |
| 6.00986674631704 | 1.302 | 1.047 | 0.881 |
| 6.01300833897063 | 1.304 | 1.048 | 0.882 |
| 6.01614993162422 | 1.307 | 1.05 | 0.884 |
| 6.019291524277808 | 1.309 | 1.052 | 0.885 |
| 6.022433116931398 | 1.311 | 1.054 | 0.887 |
| 6.025574709584988 | 1.313 | 1.055 | 0.888 |
| 6.028716302238577 | 1.315 | 1.057 | 0.89 |
| 6.031857894892167 | 1.317 | 1.059 | 0.891 |
| 6.034999487545757 | 1.319 | 1.061 | 0.893 |
| 6.038141080199346 | 1.321 | 1.063 | 0.895 |
| 6.041282672852935 | 1.323 | 1.064 | 0.896 |
| 6.044424265506525 | 1.325 | 1.066 | 0.898 |
| 6.047565858160115 | 1.328 | 1.068 | 0.899 |
| 6.050707450813704 | 1.33 | 1.07 | 0.901 |
| 6.053849043467294 | 1.332 | 1.072 | 0.903 |
| 6.056990636120884 | 1.334 | 1.074 | 0.904 |
| 6.060132228774473 | 1.336 | 1.076 | 0.906 |
| 6.063273821428063 | 1.338 | 1.077 | 0.908 |
| 6.066415414081653 | 1.341 | 1.079 | 0.909 |
| 6.069557006735242 | 1.343 | 1.081 | 0.911 |
| 6.072698599388831 | 1.345 | 1.083 | 0.913 |
| 6.07584019204242 | 1.347 | 1.085 | 0.914 |
| 6.078981784696011 | 1.349 | 1.087 | 0.916 |
| 6.082123377349601 | 1.352 | 1.089 | 0.918 |
| 6.08526497000319 | 1.354 | 1.091 | 0.92 |
| 6.08840656265678 | 1.356 | 1.093 | 0.921 |
| 6.09154815531037 | 1.358 | 1.095 | 0.923 |
| 6.094689747963959 | 1.361 | 1.097 | 0.925 |
| 6.097831340617549 | 1.363 | 1.099 | 0.927 |
| 6.100972933271138 | 1.365 | 1.101 | 0.929 |
| 6.104114525924728 | 1.368 | 1.103 | 0.93 |
| 6.107256118578317 | 1.37 | 1.105 | 0.932 |
| 6.110397711231907 | 1.372 | 1.107 | 0.934 |
| 6.113539303885497 | 1.375 | 1.109 | 0.936 |
| 6.116680896539086 | 1.377 | 1.111 | 0.938 |
| 6.119822489192675 | 1.379 | 1.113 | 0.94 |
| 6.122964081846265 | 1.382 | 1.116 | 0.942 |
| 6.126105674499855 | 1.384 | 1.118 | 0.944 |
| 6.129247267153445 | 1.386 | 1.12 | 0.946 |
| 6.132388859807034 | 1.389 | 1.122 | 0.948 |
| 6.135530452460624 | 1.391 | 1.124 | 0.949 |
| 6.138672045114213 | 1.394 | 1.126 | 0.951 |
| 6.141813637767803 | 1.396 | 1.129 | 0.953 |
| 6.144955230421393 | 1.399 | 1.131 | 0.955 |
| 6.148096823074982 | 1.401 | 1.133 | 0.958 |
| 6.151238415728571 | 1.404 | 1.135 | 0.96 |
| 6.154380008382161 | 1.406 | 1.138 | 0.962 |
| 6.157521601035751 | 1.409 | 1.14 | 0.964 |
| 6.16066319368934 | 1.411 | 1.142 | 0.966 |
| 6.16380478634293 | 1.414 | 1.144 | 0.968 |
| 6.16694637899652 | 1.416 | 1.147 | 0.97 |
| 6.170087971650109 | 1.419 | 1.149 | 0.972 |
| 6.173229564303698 | 1.421 | 1.151 | 0.974 |
| 6.176371156957289 | 1.424 | 1.154 | 0.977 |
| 6.179512749610878 | 1.426 | 1.156 | 0.979 |
| 6.182654342264468 | 1.429 | 1.159 | 0.981 |
| 6.185795934918057 | 1.432 | 1.161 | 0.983 |
| 6.188937527571647 | 1.434 | 1.163 | 0.986 |
| 6.192079120225237 | 1.437 | 1.166 | 0.988 |
| 6.195220712878826 | 1.44 | 1.168 | 0.99 |
| 6.198362305532415 | 1.442 | 1.171 | 0.993 |
| 6.201503898186005 | 1.445 | 1.173 | 0.995 |
| 6.204645490839594 | 1.448 | 1.176 | 0.997 |
| 6.207787083493184 | 1.45 | 1.178 | 1 |
| 6.210928676146774 | 1.453 | 1.181 | 1.002 |
| 6.214070268800364 | 1.456 | 1.184 | 1.005 |
| 6.217211861453953 | 1.459 | 1.186 | 1.007 |
| 6.220353454107543 | 1.462 | 1.189 | 1.01 |
| 6.223495046761133 | 1.464 | 1.192 | 1.012 |
| 6.226636639414722 | 1.467 | 1.194 | 1.015 |
| 6.229778232068312 | 1.47 | 1.197 | 1.017 |
| 6.232919824721901 | 1.473 | 1.2 | 1.02 |
| 6.236061417375491 | 1.476 | 1.202 | 1.022 |
| 6.23920301002908 | 1.479 | 1.205 | 1.025 |
| 6.24234460268267 | 1.481 | 1.208 | 1.028 |
| 6.24548619533626 | 1.484 | 1.211 | 1.03 |
| 6.24862778798985 | 1.487 | 1.214 | 1.033 |
| 6.251769380643438 | 1.49 | 1.216 | 1.036 |
| 6.254910973297028 | 1.493 | 1.219 | 1.039 |
| 6.258052565950618 | 1.496 | 1.222 | 1.042 |
| 6.261194158604208 | 1.499 | 1.225 | 1.044 |
| 6.264335751257797 | 1.502 | 1.228 | 1.047 |
| 6.267477343911387 | 1.505 | 1.231 | 1.05 |
| 6.270618936564976 | 1.508 | 1.234 | 1.053 |
| 6.273760529218566 | 1.511 | 1.237 | 1.056 |
| 6.276902121872155 | 1.514 | 1.24 | 1.059 |
| 6.280043714525745 | 1.518 | 1.243 | 1.062 |
| 6.283185307179335 | 1.521 | 1.246 | 1.066 |